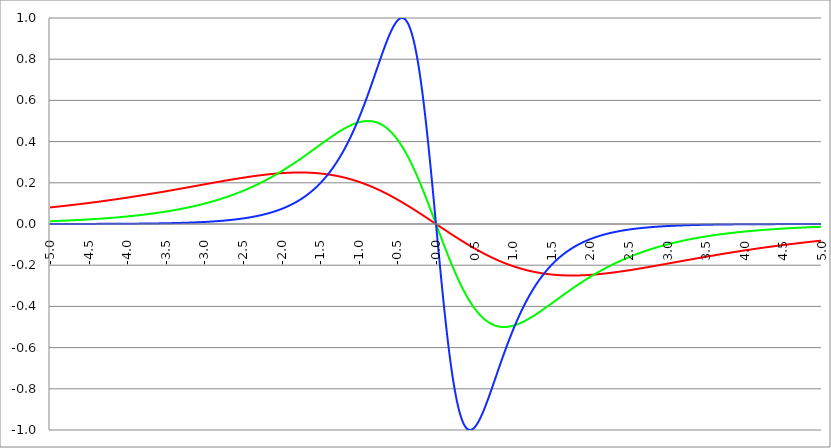
| Category | Series 1 | Series 0 | Series 2 |
|---|---|---|---|
| -5.0 | 0.08 | 0.013 | 0 |
| -4.995 | 0.081 | 0.014 | 0 |
| -4.99 | 0.081 | 0.014 | 0 |
| -4.985 | 0.081 | 0.014 | 0 |
| -4.98 | 0.081 | 0.014 | 0 |
| -4.975 | 0.081 | 0.014 | 0 |
| -4.97 | 0.082 | 0.014 | 0 |
| -4.965000000000001 | 0.082 | 0.014 | 0 |
| -4.960000000000001 | 0.082 | 0.014 | 0 |
| -4.955000000000001 | 0.082 | 0.014 | 0 |
| -4.950000000000001 | 0.082 | 0.014 | 0 |
| -4.945000000000001 | 0.083 | 0.014 | 0 |
| -4.940000000000001 | 0.083 | 0.014 | 0 |
| -4.935000000000001 | 0.083 | 0.014 | 0 |
| -4.930000000000001 | 0.083 | 0.014 | 0 |
| -4.925000000000002 | 0.083 | 0.015 | 0 |
| -4.920000000000002 | 0.084 | 0.015 | 0 |
| -4.915000000000002 | 0.084 | 0.015 | 0 |
| -4.910000000000002 | 0.084 | 0.015 | 0 |
| -4.905000000000002 | 0.084 | 0.015 | 0 |
| -4.900000000000002 | 0.084 | 0.015 | 0 |
| -4.895000000000002 | 0.085 | 0.015 | 0 |
| -4.890000000000002 | 0.085 | 0.015 | 0 |
| -4.885000000000002 | 0.085 | 0.015 | 0 |
| -4.880000000000002 | 0.085 | 0.015 | 0 |
| -4.875000000000003 | 0.085 | 0.015 | 0 |
| -4.870000000000003 | 0.086 | 0.015 | 0 |
| -4.865000000000003 | 0.086 | 0.015 | 0 |
| -4.860000000000003 | 0.086 | 0.015 | 0 |
| -4.855000000000003 | 0.086 | 0.016 | 0 |
| -4.850000000000003 | 0.086 | 0.016 | 0 |
| -4.845000000000003 | 0.087 | 0.016 | 0 |
| -4.840000000000003 | 0.087 | 0.016 | 0 |
| -4.835000000000003 | 0.087 | 0.016 | 0 |
| -4.830000000000004 | 0.087 | 0.016 | 0 |
| -4.825000000000004 | 0.087 | 0.016 | 0 |
| -4.820000000000004 | 0.088 | 0.016 | 0 |
| -4.815000000000004 | 0.088 | 0.016 | 0 |
| -4.810000000000004 | 0.088 | 0.016 | 0 |
| -4.805000000000004 | 0.088 | 0.016 | 0 |
| -4.800000000000004 | 0.089 | 0.016 | 0 |
| -4.795000000000004 | 0.089 | 0.017 | 0 |
| -4.790000000000004 | 0.089 | 0.017 | 0 |
| -4.785000000000004 | 0.089 | 0.017 | 0 |
| -4.780000000000004 | 0.089 | 0.017 | 0 |
| -4.775000000000004 | 0.09 | 0.017 | 0 |
| -4.770000000000004 | 0.09 | 0.017 | 0 |
| -4.765000000000005 | 0.09 | 0.017 | 0 |
| -4.760000000000005 | 0.09 | 0.017 | 0 |
| -4.755000000000005 | 0.09 | 0.017 | 0 |
| -4.750000000000005 | 0.091 | 0.017 | 0 |
| -4.745000000000005 | 0.091 | 0.017 | 0 |
| -4.740000000000005 | 0.091 | 0.017 | 0 |
| -4.735000000000005 | 0.091 | 0.018 | 0 |
| -4.730000000000005 | 0.091 | 0.018 | 0 |
| -4.725000000000006 | 0.092 | 0.018 | 0 |
| -4.720000000000006 | 0.092 | 0.018 | 0 |
| -4.715000000000006 | 0.092 | 0.018 | 0 |
| -4.710000000000006 | 0.092 | 0.018 | 0 |
| -4.705000000000006 | 0.093 | 0.018 | 0 |
| -4.700000000000006 | 0.093 | 0.018 | 0 |
| -4.695000000000006 | 0.093 | 0.018 | 0 |
| -4.690000000000006 | 0.093 | 0.018 | 0 |
| -4.685000000000007 | 0.093 | 0.018 | 0 |
| -4.680000000000007 | 0.094 | 0.019 | 0 |
| -4.675000000000007 | 0.094 | 0.019 | 0 |
| -4.670000000000007 | 0.094 | 0.019 | 0 |
| -4.665000000000007 | 0.094 | 0.019 | 0 |
| -4.660000000000007 | 0.095 | 0.019 | 0 |
| -4.655000000000007 | 0.095 | 0.019 | 0 |
| -4.650000000000007 | 0.095 | 0.019 | 0 |
| -4.645000000000007 | 0.095 | 0.019 | 0 |
| -4.640000000000008 | 0.095 | 0.019 | 0 |
| -4.635000000000008 | 0.096 | 0.019 | 0 |
| -4.630000000000008 | 0.096 | 0.02 | 0 |
| -4.625000000000008 | 0.096 | 0.02 | 0 |
| -4.620000000000008 | 0.096 | 0.02 | 0 |
| -4.615000000000008 | 0.097 | 0.02 | 0 |
| -4.610000000000008 | 0.097 | 0.02 | 0 |
| -4.605000000000008 | 0.097 | 0.02 | 0 |
| -4.600000000000008 | 0.097 | 0.02 | 0 |
| -4.595000000000009 | 0.098 | 0.02 | 0 |
| -4.590000000000009 | 0.098 | 0.02 | 0 |
| -4.585000000000009 | 0.098 | 0.02 | 0 |
| -4.580000000000009 | 0.098 | 0.021 | 0 |
| -4.57500000000001 | 0.098 | 0.021 | 0 |
| -4.57000000000001 | 0.099 | 0.021 | 0 |
| -4.565000000000009 | 0.099 | 0.021 | 0 |
| -4.560000000000009 | 0.099 | 0.021 | 0 |
| -4.555000000000009 | 0.099 | 0.021 | 0 |
| -4.55000000000001 | 0.1 | 0.021 | 0 |
| -4.54500000000001 | 0.1 | 0.021 | 0 |
| -4.54000000000001 | 0.1 | 0.021 | 0 |
| -4.53500000000001 | 0.1 | 0.021 | 0 |
| -4.53000000000001 | 0.101 | 0.022 | 0 |
| -4.52500000000001 | 0.101 | 0.022 | 0 |
| -4.52000000000001 | 0.101 | 0.022 | 0 |
| -4.51500000000001 | 0.101 | 0.022 | 0 |
| -4.51000000000001 | 0.101 | 0.022 | 0 |
| -4.505000000000011 | 0.102 | 0.022 | 0 |
| -4.500000000000011 | 0.102 | 0.022 | 0 |
| -4.495000000000011 | 0.102 | 0.022 | 0 |
| -4.490000000000011 | 0.102 | 0.022 | 0.001 |
| -4.485000000000011 | 0.103 | 0.023 | 0.001 |
| -4.480000000000011 | 0.103 | 0.023 | 0.001 |
| -4.475000000000011 | 0.103 | 0.023 | 0.001 |
| -4.470000000000011 | 0.103 | 0.023 | 0.001 |
| -4.465000000000011 | 0.104 | 0.023 | 0.001 |
| -4.460000000000011 | 0.104 | 0.023 | 0.001 |
| -4.455000000000012 | 0.104 | 0.023 | 0.001 |
| -4.450000000000012 | 0.104 | 0.023 | 0.001 |
| -4.445000000000012 | 0.105 | 0.023 | 0.001 |
| -4.440000000000012 | 0.105 | 0.024 | 0.001 |
| -4.435000000000012 | 0.105 | 0.024 | 0.001 |
| -4.430000000000012 | 0.105 | 0.024 | 0.001 |
| -4.425000000000012 | 0.106 | 0.024 | 0.001 |
| -4.420000000000012 | 0.106 | 0.024 | 0.001 |
| -4.415000000000012 | 0.106 | 0.024 | 0.001 |
| -4.410000000000013 | 0.106 | 0.024 | 0.001 |
| -4.405000000000013 | 0.107 | 0.024 | 0.001 |
| -4.400000000000013 | 0.107 | 0.025 | 0.001 |
| -4.395000000000013 | 0.107 | 0.025 | 0.001 |
| -4.390000000000013 | 0.107 | 0.025 | 0.001 |
| -4.385000000000013 | 0.108 | 0.025 | 0.001 |
| -4.380000000000013 | 0.108 | 0.025 | 0.001 |
| -4.375000000000013 | 0.108 | 0.025 | 0.001 |
| -4.370000000000013 | 0.108 | 0.025 | 0.001 |
| -4.365000000000013 | 0.109 | 0.025 | 0.001 |
| -4.360000000000014 | 0.109 | 0.026 | 0.001 |
| -4.355000000000014 | 0.109 | 0.026 | 0.001 |
| -4.350000000000014 | 0.109 | 0.026 | 0.001 |
| -4.345000000000014 | 0.11 | 0.026 | 0.001 |
| -4.340000000000014 | 0.11 | 0.026 | 0.001 |
| -4.335000000000014 | 0.11 | 0.026 | 0.001 |
| -4.330000000000014 | 0.11 | 0.026 | 0.001 |
| -4.325000000000014 | 0.111 | 0.026 | 0.001 |
| -4.320000000000014 | 0.111 | 0.027 | 0.001 |
| -4.315000000000015 | 0.111 | 0.027 | 0.001 |
| -4.310000000000015 | 0.111 | 0.027 | 0.001 |
| -4.305000000000015 | 0.112 | 0.027 | 0.001 |
| -4.300000000000015 | 0.112 | 0.027 | 0.001 |
| -4.295000000000015 | 0.112 | 0.027 | 0.001 |
| -4.290000000000015 | 0.112 | 0.027 | 0.001 |
| -4.285000000000015 | 0.113 | 0.028 | 0.001 |
| -4.280000000000015 | 0.113 | 0.028 | 0.001 |
| -4.275000000000015 | 0.113 | 0.028 | 0.001 |
| -4.270000000000015 | 0.113 | 0.028 | 0.001 |
| -4.265000000000016 | 0.114 | 0.028 | 0.001 |
| -4.260000000000016 | 0.114 | 0.028 | 0.001 |
| -4.255000000000016 | 0.114 | 0.028 | 0.001 |
| -4.250000000000016 | 0.114 | 0.029 | 0.001 |
| -4.245000000000016 | 0.115 | 0.029 | 0.001 |
| -4.240000000000016 | 0.115 | 0.029 | 0.001 |
| -4.235000000000016 | 0.115 | 0.029 | 0.001 |
| -4.230000000000016 | 0.115 | 0.029 | 0.001 |
| -4.225000000000017 | 0.116 | 0.029 | 0.001 |
| -4.220000000000017 | 0.116 | 0.029 | 0.001 |
| -4.215000000000017 | 0.116 | 0.03 | 0.001 |
| -4.210000000000017 | 0.117 | 0.03 | 0.001 |
| -4.205000000000017 | 0.117 | 0.03 | 0.001 |
| -4.200000000000017 | 0.117 | 0.03 | 0.001 |
| -4.195000000000017 | 0.117 | 0.03 | 0.001 |
| -4.190000000000017 | 0.118 | 0.03 | 0.001 |
| -4.185000000000017 | 0.118 | 0.03 | 0.001 |
| -4.180000000000017 | 0.118 | 0.031 | 0.001 |
| -4.175000000000018 | 0.118 | 0.031 | 0.001 |
| -4.170000000000018 | 0.119 | 0.031 | 0.001 |
| -4.165000000000018 | 0.119 | 0.031 | 0.001 |
| -4.160000000000018 | 0.119 | 0.031 | 0.001 |
| -4.155000000000018 | 0.12 | 0.031 | 0.001 |
| -4.150000000000018 | 0.12 | 0.032 | 0.001 |
| -4.145000000000018 | 0.12 | 0.032 | 0.001 |
| -4.140000000000018 | 0.12 | 0.032 | 0.001 |
| -4.135000000000018 | 0.121 | 0.032 | 0.001 |
| -4.130000000000019 | 0.121 | 0.032 | 0.001 |
| -4.125000000000019 | 0.121 | 0.032 | 0.001 |
| -4.120000000000019 | 0.121 | 0.032 | 0.001 |
| -4.115000000000019 | 0.122 | 0.033 | 0.001 |
| -4.110000000000019 | 0.122 | 0.033 | 0.001 |
| -4.105000000000019 | 0.122 | 0.033 | 0.001 |
| -4.100000000000019 | 0.123 | 0.033 | 0.001 |
| -4.095000000000019 | 0.123 | 0.033 | 0.001 |
| -4.090000000000019 | 0.123 | 0.033 | 0.001 |
| -4.085000000000019 | 0.123 | 0.034 | 0.001 |
| -4.08000000000002 | 0.124 | 0.034 | 0.001 |
| -4.07500000000002 | 0.124 | 0.034 | 0.001 |
| -4.07000000000002 | 0.124 | 0.034 | 0.001 |
| -4.06500000000002 | 0.124 | 0.034 | 0.001 |
| -4.06000000000002 | 0.125 | 0.034 | 0.001 |
| -4.05500000000002 | 0.125 | 0.035 | 0.001 |
| -4.05000000000002 | 0.125 | 0.035 | 0.001 |
| -4.04500000000002 | 0.126 | 0.035 | 0.001 |
| -4.04000000000002 | 0.126 | 0.035 | 0.001 |
| -4.03500000000002 | 0.126 | 0.035 | 0.001 |
| -4.03000000000002 | 0.126 | 0.036 | 0.001 |
| -4.025000000000021 | 0.127 | 0.036 | 0.001 |
| -4.020000000000021 | 0.127 | 0.036 | 0.001 |
| -4.015000000000021 | 0.127 | 0.036 | 0.001 |
| -4.010000000000021 | 0.128 | 0.036 | 0.001 |
| -4.005000000000021 | 0.128 | 0.036 | 0.001 |
| -4.000000000000021 | 0.128 | 0.037 | 0.001 |
| -3.995000000000021 | 0.128 | 0.037 | 0.001 |
| -3.990000000000021 | 0.129 | 0.037 | 0.001 |
| -3.985000000000022 | 0.129 | 0.037 | 0.001 |
| -3.980000000000022 | 0.129 | 0.037 | 0.001 |
| -3.975000000000022 | 0.13 | 0.038 | 0.001 |
| -3.970000000000022 | 0.13 | 0.038 | 0.001 |
| -3.965000000000022 | 0.13 | 0.038 | 0.001 |
| -3.960000000000022 | 0.13 | 0.038 | 0.001 |
| -3.955000000000022 | 0.131 | 0.038 | 0.001 |
| -3.950000000000022 | 0.131 | 0.038 | 0.001 |
| -3.945000000000022 | 0.131 | 0.039 | 0.001 |
| -3.940000000000023 | 0.132 | 0.039 | 0.002 |
| -3.935000000000023 | 0.132 | 0.039 | 0.002 |
| -3.930000000000023 | 0.132 | 0.039 | 0.002 |
| -3.925000000000023 | 0.132 | 0.039 | 0.002 |
| -3.920000000000023 | 0.133 | 0.04 | 0.002 |
| -3.915000000000023 | 0.133 | 0.04 | 0.002 |
| -3.910000000000023 | 0.133 | 0.04 | 0.002 |
| -3.905000000000023 | 0.134 | 0.04 | 0.002 |
| -3.900000000000023 | 0.134 | 0.04 | 0.002 |
| -3.895000000000023 | 0.134 | 0.041 | 0.002 |
| -3.890000000000024 | 0.135 | 0.041 | 0.002 |
| -3.885000000000024 | 0.135 | 0.041 | 0.002 |
| -3.880000000000024 | 0.135 | 0.041 | 0.002 |
| -3.875000000000024 | 0.135 | 0.041 | 0.002 |
| -3.870000000000024 | 0.136 | 0.042 | 0.002 |
| -3.865000000000024 | 0.136 | 0.042 | 0.002 |
| -3.860000000000024 | 0.136 | 0.042 | 0.002 |
| -3.855000000000024 | 0.137 | 0.042 | 0.002 |
| -3.850000000000024 | 0.137 | 0.043 | 0.002 |
| -3.845000000000025 | 0.137 | 0.043 | 0.002 |
| -3.840000000000025 | 0.137 | 0.043 | 0.002 |
| -3.835000000000025 | 0.138 | 0.043 | 0.002 |
| -3.830000000000025 | 0.138 | 0.043 | 0.002 |
| -3.825000000000025 | 0.138 | 0.044 | 0.002 |
| -3.820000000000025 | 0.139 | 0.044 | 0.002 |
| -3.815000000000025 | 0.139 | 0.044 | 0.002 |
| -3.810000000000025 | 0.139 | 0.044 | 0.002 |
| -3.805000000000025 | 0.14 | 0.044 | 0.002 |
| -3.800000000000026 | 0.14 | 0.045 | 0.002 |
| -3.795000000000026 | 0.14 | 0.045 | 0.002 |
| -3.790000000000026 | 0.141 | 0.045 | 0.002 |
| -3.785000000000026 | 0.141 | 0.045 | 0.002 |
| -3.780000000000026 | 0.141 | 0.046 | 0.002 |
| -3.775000000000026 | 0.141 | 0.046 | 0.002 |
| -3.770000000000026 | 0.142 | 0.046 | 0.002 |
| -3.765000000000026 | 0.142 | 0.046 | 0.002 |
| -3.760000000000026 | 0.142 | 0.046 | 0.002 |
| -3.755000000000026 | 0.143 | 0.047 | 0.002 |
| -3.750000000000027 | 0.143 | 0.047 | 0.002 |
| -3.745000000000027 | 0.143 | 0.047 | 0.002 |
| -3.740000000000027 | 0.144 | 0.047 | 0.002 |
| -3.735000000000027 | 0.144 | 0.048 | 0.002 |
| -3.730000000000027 | 0.144 | 0.048 | 0.002 |
| -3.725000000000027 | 0.144 | 0.048 | 0.002 |
| -3.720000000000027 | 0.145 | 0.048 | 0.002 |
| -3.715000000000027 | 0.145 | 0.049 | 0.002 |
| -3.710000000000027 | 0.145 | 0.049 | 0.002 |
| -3.705000000000028 | 0.146 | 0.049 | 0.002 |
| -3.700000000000028 | 0.146 | 0.049 | 0.002 |
| -3.695000000000028 | 0.146 | 0.05 | 0.002 |
| -3.690000000000028 | 0.147 | 0.05 | 0.002 |
| -3.685000000000028 | 0.147 | 0.05 | 0.003 |
| -3.680000000000028 | 0.147 | 0.05 | 0.003 |
| -3.675000000000028 | 0.148 | 0.051 | 0.003 |
| -3.670000000000028 | 0.148 | 0.051 | 0.003 |
| -3.665000000000028 | 0.148 | 0.051 | 0.003 |
| -3.660000000000028 | 0.149 | 0.051 | 0.003 |
| -3.655000000000029 | 0.149 | 0.052 | 0.003 |
| -3.650000000000029 | 0.149 | 0.052 | 0.003 |
| -3.645000000000029 | 0.149 | 0.052 | 0.003 |
| -3.640000000000029 | 0.15 | 0.052 | 0.003 |
| -3.635000000000029 | 0.15 | 0.053 | 0.003 |
| -3.630000000000029 | 0.15 | 0.053 | 0.003 |
| -3.625000000000029 | 0.151 | 0.053 | 0.003 |
| -3.620000000000029 | 0.151 | 0.053 | 0.003 |
| -3.615000000000029 | 0.151 | 0.054 | 0.003 |
| -3.61000000000003 | 0.152 | 0.054 | 0.003 |
| -3.60500000000003 | 0.152 | 0.054 | 0.003 |
| -3.60000000000003 | 0.152 | 0.055 | 0.003 |
| -3.59500000000003 | 0.153 | 0.055 | 0.003 |
| -3.59000000000003 | 0.153 | 0.055 | 0.003 |
| -3.58500000000003 | 0.153 | 0.055 | 0.003 |
| -3.58000000000003 | 0.154 | 0.056 | 0.003 |
| -3.57500000000003 | 0.154 | 0.056 | 0.003 |
| -3.57000000000003 | 0.154 | 0.056 | 0.003 |
| -3.565000000000031 | 0.155 | 0.056 | 0.003 |
| -3.560000000000031 | 0.155 | 0.057 | 0.003 |
| -3.555000000000031 | 0.155 | 0.057 | 0.003 |
| -3.550000000000031 | 0.156 | 0.057 | 0.003 |
| -3.545000000000031 | 0.156 | 0.058 | 0.003 |
| -3.540000000000031 | 0.156 | 0.058 | 0.003 |
| -3.535000000000031 | 0.157 | 0.058 | 0.003 |
| -3.530000000000031 | 0.157 | 0.058 | 0.003 |
| -3.525000000000031 | 0.157 | 0.059 | 0.003 |
| -3.520000000000032 | 0.157 | 0.059 | 0.004 |
| -3.515000000000032 | 0.158 | 0.059 | 0.004 |
| -3.510000000000032 | 0.158 | 0.06 | 0.004 |
| -3.505000000000032 | 0.158 | 0.06 | 0.004 |
| -3.500000000000032 | 0.159 | 0.06 | 0.004 |
| -3.495000000000032 | 0.159 | 0.061 | 0.004 |
| -3.490000000000032 | 0.159 | 0.061 | 0.004 |
| -3.485000000000032 | 0.16 | 0.061 | 0.004 |
| -3.480000000000032 | 0.16 | 0.061 | 0.004 |
| -3.475000000000032 | 0.16 | 0.062 | 0.004 |
| -3.470000000000033 | 0.161 | 0.062 | 0.004 |
| -3.465000000000033 | 0.161 | 0.062 | 0.004 |
| -3.460000000000033 | 0.161 | 0.063 | 0.004 |
| -3.455000000000033 | 0.162 | 0.063 | 0.004 |
| -3.450000000000033 | 0.162 | 0.063 | 0.004 |
| -3.445000000000033 | 0.162 | 0.064 | 0.004 |
| -3.440000000000033 | 0.163 | 0.064 | 0.004 |
| -3.435000000000033 | 0.163 | 0.064 | 0.004 |
| -3.430000000000033 | 0.163 | 0.065 | 0.004 |
| -3.425000000000034 | 0.164 | 0.065 | 0.004 |
| -3.420000000000034 | 0.164 | 0.065 | 0.004 |
| -3.415000000000034 | 0.164 | 0.066 | 0.004 |
| -3.410000000000034 | 0.165 | 0.066 | 0.004 |
| -3.405000000000034 | 0.165 | 0.066 | 0.004 |
| -3.400000000000034 | 0.165 | 0.067 | 0.004 |
| -3.395000000000034 | 0.166 | 0.067 | 0.004 |
| -3.390000000000034 | 0.166 | 0.067 | 0.005 |
| -3.385000000000034 | 0.166 | 0.068 | 0.005 |
| -3.380000000000034 | 0.167 | 0.068 | 0.005 |
| -3.375000000000035 | 0.167 | 0.068 | 0.005 |
| -3.370000000000035 | 0.167 | 0.069 | 0.005 |
| -3.365000000000035 | 0.168 | 0.069 | 0.005 |
| -3.360000000000035 | 0.168 | 0.069 | 0.005 |
| -3.355000000000035 | 0.168 | 0.07 | 0.005 |
| -3.350000000000035 | 0.169 | 0.07 | 0.005 |
| -3.345000000000035 | 0.169 | 0.07 | 0.005 |
| -3.340000000000035 | 0.169 | 0.071 | 0.005 |
| -3.335000000000035 | 0.17 | 0.071 | 0.005 |
| -3.330000000000036 | 0.17 | 0.071 | 0.005 |
| -3.325000000000036 | 0.17 | 0.072 | 0.005 |
| -3.320000000000036 | 0.171 | 0.072 | 0.005 |
| -3.315000000000036 | 0.171 | 0.072 | 0.005 |
| -3.310000000000036 | 0.171 | 0.073 | 0.005 |
| -3.305000000000036 | 0.172 | 0.073 | 0.005 |
| -3.300000000000036 | 0.172 | 0.073 | 0.005 |
| -3.295000000000036 | 0.172 | 0.074 | 0.005 |
| -3.290000000000036 | 0.173 | 0.074 | 0.006 |
| -3.285000000000036 | 0.173 | 0.075 | 0.006 |
| -3.280000000000036 | 0.173 | 0.075 | 0.006 |
| -3.275000000000037 | 0.174 | 0.075 | 0.006 |
| -3.270000000000037 | 0.174 | 0.076 | 0.006 |
| -3.265000000000037 | 0.174 | 0.076 | 0.006 |
| -3.260000000000037 | 0.175 | 0.076 | 0.006 |
| -3.255000000000037 | 0.175 | 0.077 | 0.006 |
| -3.250000000000037 | 0.175 | 0.077 | 0.006 |
| -3.245000000000037 | 0.176 | 0.078 | 0.006 |
| -3.240000000000037 | 0.176 | 0.078 | 0.006 |
| -3.235000000000038 | 0.176 | 0.078 | 0.006 |
| -3.230000000000038 | 0.177 | 0.079 | 0.006 |
| -3.225000000000038 | 0.177 | 0.079 | 0.006 |
| -3.220000000000038 | 0.177 | 0.08 | 0.006 |
| -3.215000000000038 | 0.178 | 0.08 | 0.006 |
| -3.210000000000038 | 0.178 | 0.08 | 0.007 |
| -3.205000000000038 | 0.178 | 0.081 | 0.007 |
| -3.200000000000038 | 0.179 | 0.081 | 0.007 |
| -3.195000000000038 | 0.179 | 0.082 | 0.007 |
| -3.190000000000039 | 0.179 | 0.082 | 0.007 |
| -3.185000000000039 | 0.18 | 0.082 | 0.007 |
| -3.180000000000039 | 0.18 | 0.083 | 0.007 |
| -3.175000000000039 | 0.18 | 0.083 | 0.007 |
| -3.170000000000039 | 0.181 | 0.084 | 0.007 |
| -3.16500000000004 | 0.181 | 0.084 | 0.007 |
| -3.16000000000004 | 0.182 | 0.084 | 0.007 |
| -3.155000000000039 | 0.182 | 0.085 | 0.007 |
| -3.150000000000039 | 0.182 | 0.085 | 0.007 |
| -3.14500000000004 | 0.183 | 0.086 | 0.007 |
| -3.14000000000004 | 0.183 | 0.086 | 0.007 |
| -3.13500000000004 | 0.183 | 0.087 | 0.008 |
| -3.13000000000004 | 0.184 | 0.087 | 0.008 |
| -3.12500000000004 | 0.184 | 0.087 | 0.008 |
| -3.12000000000004 | 0.184 | 0.088 | 0.008 |
| -3.11500000000004 | 0.185 | 0.088 | 0.008 |
| -3.11000000000004 | 0.185 | 0.089 | 0.008 |
| -3.10500000000004 | 0.185 | 0.089 | 0.008 |
| -3.10000000000004 | 0.186 | 0.09 | 0.008 |
| -3.095000000000041 | 0.186 | 0.09 | 0.008 |
| -3.090000000000041 | 0.186 | 0.09 | 0.008 |
| -3.085000000000041 | 0.187 | 0.091 | 0.008 |
| -3.080000000000041 | 0.187 | 0.091 | 0.008 |
| -3.075000000000041 | 0.187 | 0.092 | 0.009 |
| -3.070000000000041 | 0.188 | 0.092 | 0.009 |
| -3.065000000000041 | 0.188 | 0.093 | 0.009 |
| -3.060000000000041 | 0.188 | 0.093 | 0.009 |
| -3.055000000000041 | 0.189 | 0.094 | 0.009 |
| -3.050000000000042 | 0.189 | 0.094 | 0.009 |
| -3.045000000000042 | 0.189 | 0.095 | 0.009 |
| -3.040000000000042 | 0.19 | 0.095 | 0.009 |
| -3.035000000000042 | 0.19 | 0.095 | 0.009 |
| -3.030000000000042 | 0.19 | 0.096 | 0.009 |
| -3.025000000000042 | 0.191 | 0.096 | 0.009 |
| -3.020000000000042 | 0.191 | 0.097 | 0.01 |
| -3.015000000000042 | 0.191 | 0.097 | 0.01 |
| -3.010000000000042 | 0.192 | 0.098 | 0.01 |
| -3.005000000000043 | 0.192 | 0.098 | 0.01 |
| -3.000000000000043 | 0.192 | 0.099 | 0.01 |
| -2.995000000000043 | 0.193 | 0.099 | 0.01 |
| -2.990000000000043 | 0.193 | 0.1 | 0.01 |
| -2.985000000000043 | 0.193 | 0.1 | 0.01 |
| -2.980000000000043 | 0.194 | 0.101 | 0.01 |
| -2.975000000000043 | 0.194 | 0.101 | 0.01 |
| -2.970000000000043 | 0.194 | 0.102 | 0.011 |
| -2.965000000000043 | 0.195 | 0.102 | 0.011 |
| -2.960000000000043 | 0.195 | 0.103 | 0.011 |
| -2.955000000000044 | 0.195 | 0.103 | 0.011 |
| -2.950000000000044 | 0.196 | 0.104 | 0.011 |
| -2.945000000000044 | 0.196 | 0.104 | 0.011 |
| -2.940000000000044 | 0.196 | 0.105 | 0.011 |
| -2.935000000000044 | 0.197 | 0.105 | 0.011 |
| -2.930000000000044 | 0.197 | 0.106 | 0.011 |
| -2.925000000000044 | 0.197 | 0.106 | 0.012 |
| -2.920000000000044 | 0.198 | 0.107 | 0.012 |
| -2.915000000000044 | 0.198 | 0.107 | 0.012 |
| -2.910000000000045 | 0.198 | 0.108 | 0.012 |
| -2.905000000000045 | 0.199 | 0.109 | 0.012 |
| -2.900000000000045 | 0.199 | 0.109 | 0.012 |
| -2.895000000000045 | 0.199 | 0.11 | 0.012 |
| -2.890000000000045 | 0.2 | 0.11 | 0.012 |
| -2.885000000000045 | 0.2 | 0.111 | 0.012 |
| -2.880000000000045 | 0.2 | 0.111 | 0.013 |
| -2.875000000000045 | 0.201 | 0.112 | 0.013 |
| -2.870000000000045 | 0.201 | 0.112 | 0.013 |
| -2.865000000000045 | 0.201 | 0.113 | 0.013 |
| -2.860000000000046 | 0.202 | 0.113 | 0.013 |
| -2.855000000000046 | 0.202 | 0.114 | 0.013 |
| -2.850000000000046 | 0.202 | 0.115 | 0.013 |
| -2.845000000000046 | 0.203 | 0.115 | 0.014 |
| -2.840000000000046 | 0.203 | 0.116 | 0.014 |
| -2.835000000000046 | 0.203 | 0.116 | 0.014 |
| -2.830000000000046 | 0.204 | 0.117 | 0.014 |
| -2.825000000000046 | 0.204 | 0.117 | 0.014 |
| -2.820000000000046 | 0.204 | 0.118 | 0.014 |
| -2.815000000000047 | 0.205 | 0.119 | 0.014 |
| -2.810000000000047 | 0.205 | 0.119 | 0.014 |
| -2.805000000000047 | 0.205 | 0.12 | 0.015 |
| -2.800000000000047 | 0.206 | 0.12 | 0.015 |
| -2.795000000000047 | 0.206 | 0.121 | 0.015 |
| -2.790000000000047 | 0.206 | 0.121 | 0.015 |
| -2.785000000000047 | 0.207 | 0.122 | 0.015 |
| -2.780000000000047 | 0.207 | 0.123 | 0.015 |
| -2.775000000000047 | 0.207 | 0.123 | 0.016 |
| -2.770000000000047 | 0.208 | 0.124 | 0.016 |
| -2.765000000000048 | 0.208 | 0.124 | 0.016 |
| -2.760000000000048 | 0.208 | 0.125 | 0.016 |
| -2.755000000000048 | 0.209 | 0.126 | 0.016 |
| -2.750000000000048 | 0.209 | 0.126 | 0.016 |
| -2.745000000000048 | 0.209 | 0.127 | 0.017 |
| -2.740000000000048 | 0.21 | 0.128 | 0.017 |
| -2.735000000000048 | 0.21 | 0.128 | 0.017 |
| -2.730000000000048 | 0.21 | 0.129 | 0.017 |
| -2.725000000000048 | 0.211 | 0.129 | 0.017 |
| -2.720000000000049 | 0.211 | 0.13 | 0.017 |
| -2.715000000000049 | 0.211 | 0.131 | 0.018 |
| -2.710000000000049 | 0.212 | 0.131 | 0.018 |
| -2.705000000000049 | 0.212 | 0.132 | 0.018 |
| -2.700000000000049 | 0.212 | 0.133 | 0.018 |
| -2.695000000000049 | 0.213 | 0.133 | 0.018 |
| -2.690000000000049 | 0.213 | 0.134 | 0.018 |
| -2.685000000000049 | 0.213 | 0.135 | 0.019 |
| -2.680000000000049 | 0.214 | 0.135 | 0.019 |
| -2.675000000000049 | 0.214 | 0.136 | 0.019 |
| -2.67000000000005 | 0.214 | 0.137 | 0.019 |
| -2.66500000000005 | 0.215 | 0.137 | 0.019 |
| -2.66000000000005 | 0.215 | 0.138 | 0.02 |
| -2.65500000000005 | 0.215 | 0.139 | 0.02 |
| -2.65000000000005 | 0.215 | 0.139 | 0.02 |
| -2.64500000000005 | 0.216 | 0.14 | 0.02 |
| -2.64000000000005 | 0.216 | 0.141 | 0.02 |
| -2.63500000000005 | 0.216 | 0.141 | 0.021 |
| -2.63000000000005 | 0.217 | 0.142 | 0.021 |
| -2.625000000000051 | 0.217 | 0.143 | 0.021 |
| -2.620000000000051 | 0.217 | 0.143 | 0.021 |
| -2.615000000000051 | 0.218 | 0.144 | 0.021 |
| -2.610000000000051 | 0.218 | 0.145 | 0.022 |
| -2.605000000000051 | 0.218 | 0.145 | 0.022 |
| -2.600000000000051 | 0.219 | 0.146 | 0.022 |
| -2.595000000000051 | 0.219 | 0.147 | 0.022 |
| -2.590000000000051 | 0.219 | 0.148 | 0.023 |
| -2.585000000000051 | 0.22 | 0.148 | 0.023 |
| -2.580000000000052 | 0.22 | 0.149 | 0.023 |
| -2.575000000000052 | 0.22 | 0.15 | 0.023 |
| -2.570000000000052 | 0.22 | 0.15 | 0.023 |
| -2.565000000000052 | 0.221 | 0.151 | 0.024 |
| -2.560000000000052 | 0.221 | 0.152 | 0.024 |
| -2.555000000000052 | 0.221 | 0.153 | 0.024 |
| -2.550000000000052 | 0.222 | 0.153 | 0.024 |
| -2.545000000000052 | 0.222 | 0.154 | 0.025 |
| -2.540000000000052 | 0.222 | 0.155 | 0.025 |
| -2.535000000000053 | 0.223 | 0.156 | 0.025 |
| -2.530000000000053 | 0.223 | 0.156 | 0.025 |
| -2.525000000000053 | 0.223 | 0.157 | 0.026 |
| -2.520000000000053 | 0.223 | 0.158 | 0.026 |
| -2.515000000000053 | 0.224 | 0.159 | 0.026 |
| -2.510000000000053 | 0.224 | 0.159 | 0.026 |
| -2.505000000000053 | 0.224 | 0.16 | 0.027 |
| -2.500000000000053 | 0.225 | 0.161 | 0.027 |
| -2.495000000000053 | 0.225 | 0.162 | 0.027 |
| -2.490000000000053 | 0.225 | 0.162 | 0.027 |
| -2.485000000000054 | 0.225 | 0.163 | 0.028 |
| -2.480000000000054 | 0.226 | 0.164 | 0.028 |
| -2.475000000000054 | 0.226 | 0.165 | 0.028 |
| -2.470000000000054 | 0.226 | 0.166 | 0.029 |
| -2.465000000000054 | 0.227 | 0.166 | 0.029 |
| -2.460000000000054 | 0.227 | 0.167 | 0.029 |
| -2.455000000000054 | 0.227 | 0.168 | 0.029 |
| -2.450000000000054 | 0.227 | 0.169 | 0.03 |
| -2.445000000000054 | 0.228 | 0.17 | 0.03 |
| -2.440000000000055 | 0.228 | 0.17 | 0.03 |
| -2.435000000000055 | 0.228 | 0.171 | 0.031 |
| -2.430000000000055 | 0.229 | 0.172 | 0.031 |
| -2.425000000000055 | 0.229 | 0.173 | 0.031 |
| -2.420000000000055 | 0.229 | 0.174 | 0.032 |
| -2.415000000000055 | 0.229 | 0.175 | 0.032 |
| -2.410000000000055 | 0.23 | 0.175 | 0.032 |
| -2.405000000000055 | 0.23 | 0.176 | 0.033 |
| -2.400000000000055 | 0.23 | 0.177 | 0.033 |
| -2.395000000000055 | 0.23 | 0.178 | 0.033 |
| -2.390000000000056 | 0.231 | 0.179 | 0.034 |
| -2.385000000000056 | 0.231 | 0.18 | 0.034 |
| -2.380000000000056 | 0.231 | 0.18 | 0.034 |
| -2.375000000000056 | 0.232 | 0.181 | 0.035 |
| -2.370000000000056 | 0.232 | 0.182 | 0.035 |
| -2.365000000000056 | 0.232 | 0.183 | 0.035 |
| -2.360000000000056 | 0.232 | 0.184 | 0.036 |
| -2.355000000000056 | 0.233 | 0.185 | 0.036 |
| -2.350000000000056 | 0.233 | 0.186 | 0.036 |
| -2.345000000000057 | 0.233 | 0.186 | 0.037 |
| -2.340000000000057 | 0.233 | 0.187 | 0.037 |
| -2.335000000000057 | 0.234 | 0.188 | 0.037 |
| -2.330000000000057 | 0.234 | 0.189 | 0.038 |
| -2.325000000000057 | 0.234 | 0.19 | 0.038 |
| -2.320000000000057 | 0.234 | 0.191 | 0.039 |
| -2.315000000000057 | 0.235 | 0.192 | 0.039 |
| -2.310000000000057 | 0.235 | 0.193 | 0.039 |
| -2.305000000000057 | 0.235 | 0.194 | 0.04 |
| -2.300000000000058 | 0.235 | 0.195 | 0.04 |
| -2.295000000000058 | 0.236 | 0.195 | 0.041 |
| -2.290000000000058 | 0.236 | 0.196 | 0.041 |
| -2.285000000000058 | 0.236 | 0.197 | 0.041 |
| -2.280000000000058 | 0.236 | 0.198 | 0.042 |
| -2.275000000000058 | 0.237 | 0.199 | 0.042 |
| -2.270000000000058 | 0.237 | 0.2 | 0.043 |
| -2.265000000000058 | 0.237 | 0.201 | 0.043 |
| -2.260000000000058 | 0.237 | 0.202 | 0.044 |
| -2.255000000000058 | 0.237 | 0.203 | 0.044 |
| -2.250000000000059 | 0.238 | 0.204 | 0.044 |
| -2.245000000000059 | 0.238 | 0.205 | 0.045 |
| -2.240000000000059 | 0.238 | 0.206 | 0.045 |
| -2.235000000000059 | 0.238 | 0.207 | 0.046 |
| -2.23000000000006 | 0.239 | 0.208 | 0.046 |
| -2.22500000000006 | 0.239 | 0.209 | 0.047 |
| -2.22000000000006 | 0.239 | 0.21 | 0.047 |
| -2.215000000000059 | 0.239 | 0.211 | 0.048 |
| -2.210000000000059 | 0.239 | 0.212 | 0.048 |
| -2.20500000000006 | 0.24 | 0.213 | 0.049 |
| -2.20000000000006 | 0.24 | 0.214 | 0.049 |
| -2.19500000000006 | 0.24 | 0.215 | 0.05 |
| -2.19000000000006 | 0.24 | 0.216 | 0.05 |
| -2.18500000000006 | 0.241 | 0.217 | 0.051 |
| -2.18000000000006 | 0.241 | 0.218 | 0.051 |
| -2.17500000000006 | 0.241 | 0.219 | 0.052 |
| -2.17000000000006 | 0.241 | 0.22 | 0.052 |
| -2.16500000000006 | 0.241 | 0.221 | 0.053 |
| -2.160000000000061 | 0.242 | 0.222 | 0.053 |
| -2.155000000000061 | 0.242 | 0.223 | 0.054 |
| -2.150000000000061 | 0.242 | 0.224 | 0.054 |
| -2.145000000000061 | 0.242 | 0.225 | 0.055 |
| -2.140000000000061 | 0.242 | 0.226 | 0.055 |
| -2.135000000000061 | 0.242 | 0.227 | 0.056 |
| -2.130000000000061 | 0.243 | 0.228 | 0.056 |
| -2.125000000000061 | 0.243 | 0.229 | 0.057 |
| -2.120000000000061 | 0.243 | 0.23 | 0.058 |
| -2.115000000000061 | 0.243 | 0.231 | 0.058 |
| -2.110000000000062 | 0.243 | 0.232 | 0.059 |
| -2.105000000000062 | 0.244 | 0.233 | 0.059 |
| -2.100000000000062 | 0.244 | 0.234 | 0.06 |
| -2.095000000000062 | 0.244 | 0.235 | 0.061 |
| -2.090000000000062 | 0.244 | 0.236 | 0.061 |
| -2.085000000000062 | 0.244 | 0.237 | 0.062 |
| -2.080000000000062 | 0.244 | 0.238 | 0.062 |
| -2.075000000000062 | 0.245 | 0.24 | 0.063 |
| -2.070000000000062 | 0.245 | 0.241 | 0.064 |
| -2.065000000000063 | 0.245 | 0.242 | 0.064 |
| -2.060000000000063 | 0.245 | 0.243 | 0.065 |
| -2.055000000000063 | 0.245 | 0.244 | 0.066 |
| -2.050000000000063 | 0.245 | 0.245 | 0.066 |
| -2.045000000000063 | 0.246 | 0.246 | 0.067 |
| -2.040000000000063 | 0.246 | 0.247 | 0.068 |
| -2.035000000000063 | 0.246 | 0.248 | 0.068 |
| -2.030000000000063 | 0.246 | 0.249 | 0.069 |
| -2.025000000000063 | 0.246 | 0.251 | 0.07 |
| -2.020000000000064 | 0.246 | 0.252 | 0.07 |
| -2.015000000000064 | 0.246 | 0.253 | 0.071 |
| -2.010000000000064 | 0.247 | 0.254 | 0.072 |
| -2.005000000000064 | 0.247 | 0.255 | 0.072 |
| -2.000000000000064 | 0.247 | 0.256 | 0.073 |
| -1.995000000000064 | 0.247 | 0.257 | 0.074 |
| -1.990000000000064 | 0.247 | 0.259 | 0.075 |
| -1.985000000000064 | 0.247 | 0.26 | 0.075 |
| -1.980000000000064 | 0.247 | 0.261 | 0.076 |
| -1.975000000000064 | 0.247 | 0.262 | 0.077 |
| -1.970000000000065 | 0.248 | 0.263 | 0.078 |
| -1.965000000000065 | 0.248 | 0.264 | 0.078 |
| -1.960000000000065 | 0.248 | 0.265 | 0.079 |
| -1.955000000000065 | 0.248 | 0.267 | 0.08 |
| -1.950000000000065 | 0.248 | 0.268 | 0.081 |
| -1.945000000000065 | 0.248 | 0.269 | 0.082 |
| -1.940000000000065 | 0.248 | 0.27 | 0.082 |
| -1.935000000000065 | 0.248 | 0.271 | 0.083 |
| -1.930000000000065 | 0.248 | 0.273 | 0.084 |
| -1.925000000000066 | 0.248 | 0.274 | 0.085 |
| -1.920000000000066 | 0.249 | 0.275 | 0.086 |
| -1.915000000000066 | 0.249 | 0.276 | 0.087 |
| -1.910000000000066 | 0.249 | 0.277 | 0.088 |
| -1.905000000000066 | 0.249 | 0.279 | 0.088 |
| -1.900000000000066 | 0.249 | 0.28 | 0.089 |
| -1.895000000000066 | 0.249 | 0.281 | 0.09 |
| -1.890000000000066 | 0.249 | 0.282 | 0.091 |
| -1.885000000000066 | 0.249 | 0.283 | 0.092 |
| -1.880000000000066 | 0.249 | 0.285 | 0.093 |
| -1.875000000000067 | 0.249 | 0.286 | 0.094 |
| -1.870000000000067 | 0.249 | 0.287 | 0.095 |
| -1.865000000000067 | 0.249 | 0.288 | 0.096 |
| -1.860000000000067 | 0.249 | 0.29 | 0.097 |
| -1.855000000000067 | 0.249 | 0.291 | 0.098 |
| -1.850000000000067 | 0.25 | 0.292 | 0.099 |
| -1.845000000000067 | 0.25 | 0.293 | 0.1 |
| -1.840000000000067 | 0.25 | 0.295 | 0.101 |
| -1.835000000000067 | 0.25 | 0.296 | 0.102 |
| -1.830000000000068 | 0.25 | 0.297 | 0.103 |
| -1.825000000000068 | 0.25 | 0.298 | 0.104 |
| -1.820000000000068 | 0.25 | 0.3 | 0.105 |
| -1.815000000000068 | 0.25 | 0.301 | 0.106 |
| -1.810000000000068 | 0.25 | 0.302 | 0.107 |
| -1.805000000000068 | 0.25 | 0.303 | 0.108 |
| -1.800000000000068 | 0.25 | 0.305 | 0.109 |
| -1.795000000000068 | 0.25 | 0.306 | 0.11 |
| -1.790000000000068 | 0.25 | 0.307 | 0.111 |
| -1.785000000000068 | 0.25 | 0.309 | 0.112 |
| -1.780000000000069 | 0.25 | 0.31 | 0.113 |
| -1.775000000000069 | 0.25 | 0.311 | 0.115 |
| -1.770000000000069 | 0.25 | 0.312 | 0.116 |
| -1.765000000000069 | 0.25 | 0.314 | 0.117 |
| -1.760000000000069 | 0.25 | 0.315 | 0.118 |
| -1.75500000000007 | 0.25 | 0.316 | 0.119 |
| -1.75000000000007 | 0.25 | 0.318 | 0.12 |
| -1.745000000000069 | 0.25 | 0.319 | 0.122 |
| -1.740000000000069 | 0.25 | 0.32 | 0.123 |
| -1.73500000000007 | 0.25 | 0.322 | 0.124 |
| -1.73000000000007 | 0.25 | 0.323 | 0.125 |
| -1.72500000000007 | 0.25 | 0.324 | 0.127 |
| -1.72000000000007 | 0.25 | 0.325 | 0.128 |
| -1.71500000000007 | 0.25 | 0.327 | 0.129 |
| -1.71000000000007 | 0.25 | 0.328 | 0.13 |
| -1.70500000000007 | 0.25 | 0.329 | 0.132 |
| -1.70000000000007 | 0.25 | 0.331 | 0.133 |
| -1.69500000000007 | 0.25 | 0.332 | 0.134 |
| -1.69000000000007 | 0.25 | 0.333 | 0.136 |
| -1.685000000000071 | 0.25 | 0.335 | 0.137 |
| -1.680000000000071 | 0.25 | 0.336 | 0.138 |
| -1.675000000000071 | 0.25 | 0.337 | 0.14 |
| -1.670000000000071 | 0.249 | 0.339 | 0.141 |
| -1.665000000000071 | 0.249 | 0.34 | 0.143 |
| -1.660000000000071 | 0.249 | 0.341 | 0.144 |
| -1.655000000000071 | 0.249 | 0.343 | 0.145 |
| -1.650000000000071 | 0.249 | 0.344 | 0.147 |
| -1.645000000000071 | 0.249 | 0.345 | 0.148 |
| -1.640000000000072 | 0.249 | 0.347 | 0.15 |
| -1.635000000000072 | 0.249 | 0.348 | 0.151 |
| -1.630000000000072 | 0.249 | 0.349 | 0.153 |
| -1.625000000000072 | 0.249 | 0.351 | 0.154 |
| -1.620000000000072 | 0.249 | 0.352 | 0.156 |
| -1.615000000000072 | 0.249 | 0.354 | 0.157 |
| -1.610000000000072 | 0.248 | 0.355 | 0.159 |
| -1.605000000000072 | 0.248 | 0.356 | 0.161 |
| -1.600000000000072 | 0.248 | 0.358 | 0.162 |
| -1.595000000000073 | 0.248 | 0.359 | 0.164 |
| -1.590000000000073 | 0.248 | 0.36 | 0.165 |
| -1.585000000000073 | 0.248 | 0.362 | 0.167 |
| -1.580000000000073 | 0.248 | 0.363 | 0.169 |
| -1.575000000000073 | 0.248 | 0.364 | 0.17 |
| -1.570000000000073 | 0.248 | 0.366 | 0.172 |
| -1.565000000000073 | 0.247 | 0.367 | 0.174 |
| -1.560000000000073 | 0.247 | 0.368 | 0.176 |
| -1.555000000000073 | 0.247 | 0.37 | 0.177 |
| -1.550000000000074 | 0.247 | 0.371 | 0.179 |
| -1.545000000000074 | 0.247 | 0.373 | 0.181 |
| -1.540000000000074 | 0.247 | 0.374 | 0.183 |
| -1.535000000000074 | 0.247 | 0.375 | 0.184 |
| -1.530000000000074 | 0.246 | 0.377 | 0.186 |
| -1.525000000000074 | 0.246 | 0.378 | 0.188 |
| -1.520000000000074 | 0.246 | 0.379 | 0.19 |
| -1.515000000000074 | 0.246 | 0.381 | 0.192 |
| -1.510000000000074 | 0.246 | 0.382 | 0.194 |
| -1.505000000000074 | 0.245 | 0.383 | 0.196 |
| -1.500000000000075 | 0.245 | 0.385 | 0.198 |
| -1.495000000000075 | 0.245 | 0.386 | 0.2 |
| -1.490000000000075 | 0.245 | 0.387 | 0.202 |
| -1.485000000000075 | 0.245 | 0.389 | 0.204 |
| -1.480000000000075 | 0.245 | 0.39 | 0.206 |
| -1.475000000000075 | 0.244 | 0.392 | 0.208 |
| -1.470000000000075 | 0.244 | 0.393 | 0.21 |
| -1.465000000000075 | 0.244 | 0.394 | 0.212 |
| -1.460000000000075 | 0.244 | 0.396 | 0.214 |
| -1.455000000000076 | 0.243 | 0.397 | 0.216 |
| -1.450000000000076 | 0.243 | 0.398 | 0.218 |
| -1.445000000000076 | 0.243 | 0.4 | 0.22 |
| -1.440000000000076 | 0.243 | 0.401 | 0.222 |
| -1.435000000000076 | 0.243 | 0.402 | 0.225 |
| -1.430000000000076 | 0.242 | 0.404 | 0.227 |
| -1.425000000000076 | 0.242 | 0.405 | 0.229 |
| -1.420000000000076 | 0.242 | 0.406 | 0.231 |
| -1.415000000000076 | 0.242 | 0.408 | 0.234 |
| -1.410000000000077 | 0.241 | 0.409 | 0.236 |
| -1.405000000000077 | 0.241 | 0.41 | 0.238 |
| -1.400000000000077 | 0.241 | 0.412 | 0.241 |
| -1.395000000000077 | 0.24 | 0.413 | 0.243 |
| -1.390000000000077 | 0.24 | 0.414 | 0.245 |
| -1.385000000000077 | 0.24 | 0.416 | 0.248 |
| -1.380000000000077 | 0.24 | 0.417 | 0.25 |
| -1.375000000000077 | 0.239 | 0.418 | 0.253 |
| -1.370000000000077 | 0.239 | 0.419 | 0.255 |
| -1.365000000000077 | 0.239 | 0.421 | 0.258 |
| -1.360000000000078 | 0.238 | 0.422 | 0.26 |
| -1.355000000000078 | 0.238 | 0.423 | 0.263 |
| -1.350000000000078 | 0.238 | 0.425 | 0.265 |
| -1.345000000000078 | 0.238 | 0.426 | 0.268 |
| -1.340000000000078 | 0.237 | 0.427 | 0.27 |
| -1.335000000000078 | 0.237 | 0.428 | 0.273 |
| -1.330000000000078 | 0.237 | 0.43 | 0.276 |
| -1.325000000000078 | 0.236 | 0.431 | 0.278 |
| -1.320000000000078 | 0.236 | 0.432 | 0.281 |
| -1.315000000000079 | 0.236 | 0.434 | 0.284 |
| -1.310000000000079 | 0.235 | 0.435 | 0.287 |
| -1.305000000000079 | 0.235 | 0.436 | 0.289 |
| -1.300000000000079 | 0.235 | 0.437 | 0.292 |
| -1.295000000000079 | 0.234 | 0.438 | 0.295 |
| -1.29000000000008 | 0.234 | 0.44 | 0.298 |
| -1.285000000000079 | 0.233 | 0.441 | 0.301 |
| -1.280000000000079 | 0.233 | 0.442 | 0.304 |
| -1.275000000000079 | 0.233 | 0.443 | 0.307 |
| -1.270000000000079 | 0.232 | 0.444 | 0.31 |
| -1.26500000000008 | 0.232 | 0.446 | 0.313 |
| -1.26000000000008 | 0.232 | 0.447 | 0.316 |
| -1.25500000000008 | 0.231 | 0.448 | 0.319 |
| -1.25000000000008 | 0.231 | 0.449 | 0.322 |
| -1.24500000000008 | 0.23 | 0.45 | 0.325 |
| -1.24000000000008 | 0.23 | 0.452 | 0.328 |
| -1.23500000000008 | 0.23 | 0.453 | 0.331 |
| -1.23000000000008 | 0.229 | 0.454 | 0.334 |
| -1.22500000000008 | 0.229 | 0.455 | 0.338 |
| -1.220000000000081 | 0.228 | 0.456 | 0.341 |
| -1.215000000000081 | 0.228 | 0.457 | 0.344 |
| -1.210000000000081 | 0.227 | 0.458 | 0.347 |
| -1.205000000000081 | 0.227 | 0.459 | 0.351 |
| -1.200000000000081 | 0.227 | 0.46 | 0.354 |
| -1.195000000000081 | 0.226 | 0.461 | 0.357 |
| -1.190000000000081 | 0.226 | 0.463 | 0.361 |
| -1.185000000000081 | 0.225 | 0.464 | 0.364 |
| -1.180000000000081 | 0.225 | 0.465 | 0.368 |
| -1.175000000000082 | 0.224 | 0.466 | 0.371 |
| -1.170000000000082 | 0.224 | 0.467 | 0.375 |
| -1.165000000000082 | 0.223 | 0.468 | 0.378 |
| -1.160000000000082 | 0.223 | 0.469 | 0.382 |
| -1.155000000000082 | 0.222 | 0.47 | 0.385 |
| -1.150000000000082 | 0.222 | 0.471 | 0.389 |
| -1.145000000000082 | 0.221 | 0.472 | 0.393 |
| -1.140000000000082 | 0.221 | 0.473 | 0.397 |
| -1.135000000000082 | 0.22 | 0.474 | 0.4 |
| -1.130000000000082 | 0.22 | 0.474 | 0.404 |
| -1.125000000000083 | 0.219 | 0.475 | 0.408 |
| -1.120000000000083 | 0.219 | 0.476 | 0.412 |
| -1.115000000000083 | 0.218 | 0.477 | 0.415 |
| -1.110000000000083 | 0.218 | 0.478 | 0.419 |
| -1.105000000000083 | 0.217 | 0.479 | 0.423 |
| -1.100000000000083 | 0.217 | 0.48 | 0.427 |
| -1.095000000000083 | 0.216 | 0.481 | 0.431 |
| -1.090000000000083 | 0.216 | 0.481 | 0.435 |
| -1.085000000000083 | 0.215 | 0.482 | 0.439 |
| -1.080000000000084 | 0.214 | 0.483 | 0.443 |
| -1.075000000000084 | 0.214 | 0.484 | 0.447 |
| -1.070000000000084 | 0.213 | 0.485 | 0.452 |
| -1.065000000000084 | 0.213 | 0.485 | 0.456 |
| -1.060000000000084 | 0.212 | 0.486 | 0.46 |
| -1.055000000000084 | 0.212 | 0.487 | 0.464 |
| -1.050000000000084 | 0.211 | 0.487 | 0.468 |
| -1.045000000000084 | 0.21 | 0.488 | 0.473 |
| -1.040000000000084 | 0.21 | 0.489 | 0.477 |
| -1.035000000000085 | 0.209 | 0.489 | 0.481 |
| -1.030000000000085 | 0.209 | 0.49 | 0.486 |
| -1.025000000000085 | 0.208 | 0.491 | 0.49 |
| -1.020000000000085 | 0.207 | 0.491 | 0.494 |
| -1.015000000000085 | 0.207 | 0.492 | 0.499 |
| -1.010000000000085 | 0.206 | 0.492 | 0.503 |
| -1.005000000000085 | 0.206 | 0.493 | 0.508 |
| -1.000000000000085 | 0.205 | 0.494 | 0.512 |
| -0.995000000000085 | 0.204 | 0.494 | 0.517 |
| -0.990000000000085 | 0.204 | 0.495 | 0.522 |
| -0.985000000000085 | 0.203 | 0.495 | 0.526 |
| -0.980000000000085 | 0.202 | 0.495 | 0.531 |
| -0.975000000000085 | 0.202 | 0.496 | 0.536 |
| -0.970000000000085 | 0.201 | 0.496 | 0.54 |
| -0.965000000000085 | 0.2 | 0.497 | 0.545 |
| -0.960000000000085 | 0.2 | 0.497 | 0.55 |
| -0.955000000000085 | 0.199 | 0.497 | 0.555 |
| -0.950000000000085 | 0.198 | 0.498 | 0.56 |
| -0.945000000000085 | 0.198 | 0.498 | 0.564 |
| -0.940000000000085 | 0.197 | 0.498 | 0.569 |
| -0.935000000000085 | 0.196 | 0.499 | 0.574 |
| -0.930000000000085 | 0.196 | 0.499 | 0.579 |
| -0.925000000000085 | 0.195 | 0.499 | 0.584 |
| -0.920000000000085 | 0.194 | 0.499 | 0.589 |
| -0.915000000000085 | 0.193 | 0.499 | 0.594 |
| -0.910000000000085 | 0.193 | 0.5 | 0.599 |
| -0.905000000000085 | 0.192 | 0.5 | 0.604 |
| -0.900000000000085 | 0.191 | 0.5 | 0.609 |
| -0.895000000000085 | 0.191 | 0.5 | 0.614 |
| -0.890000000000085 | 0.19 | 0.5 | 0.62 |
| -0.885000000000085 | 0.189 | 0.5 | 0.625 |
| -0.880000000000085 | 0.188 | 0.5 | 0.63 |
| -0.875000000000085 | 0.188 | 0.5 | 0.635 |
| -0.870000000000085 | 0.187 | 0.5 | 0.64 |
| -0.865000000000085 | 0.186 | 0.5 | 0.646 |
| -0.860000000000085 | 0.185 | 0.5 | 0.651 |
| -0.855000000000085 | 0.184 | 0.5 | 0.656 |
| -0.850000000000085 | 0.184 | 0.499 | 0.661 |
| -0.845000000000085 | 0.183 | 0.499 | 0.667 |
| -0.840000000000085 | 0.182 | 0.499 | 0.672 |
| -0.835000000000085 | 0.181 | 0.499 | 0.677 |
| -0.830000000000085 | 0.181 | 0.499 | 0.683 |
| -0.825000000000085 | 0.18 | 0.498 | 0.688 |
| -0.820000000000085 | 0.179 | 0.498 | 0.694 |
| -0.815000000000085 | 0.178 | 0.498 | 0.699 |
| -0.810000000000085 | 0.177 | 0.497 | 0.704 |
| -0.805000000000085 | 0.177 | 0.497 | 0.71 |
| -0.800000000000085 | 0.176 | 0.497 | 0.715 |
| -0.795000000000085 | 0.175 | 0.496 | 0.721 |
| -0.790000000000085 | 0.174 | 0.496 | 0.726 |
| -0.785000000000085 | 0.173 | 0.495 | 0.731 |
| -0.780000000000085 | 0.172 | 0.494 | 0.737 |
| -0.775000000000085 | 0.172 | 0.494 | 0.742 |
| -0.770000000000085 | 0.171 | 0.493 | 0.748 |
| -0.765000000000085 | 0.17 | 0.493 | 0.753 |
| -0.760000000000085 | 0.169 | 0.492 | 0.759 |
| -0.755000000000085 | 0.168 | 0.491 | 0.764 |
| -0.750000000000085 | 0.167 | 0.491 | 0.77 |
| -0.745000000000085 | 0.166 | 0.49 | 0.775 |
| -0.740000000000085 | 0.166 | 0.489 | 0.78 |
| -0.735000000000085 | 0.165 | 0.488 | 0.786 |
| -0.730000000000085 | 0.164 | 0.487 | 0.791 |
| -0.725000000000085 | 0.163 | 0.486 | 0.797 |
| -0.720000000000085 | 0.162 | 0.486 | 0.802 |
| -0.715000000000085 | 0.161 | 0.485 | 0.807 |
| -0.710000000000085 | 0.16 | 0.484 | 0.813 |
| -0.705000000000085 | 0.159 | 0.483 | 0.818 |
| -0.700000000000085 | 0.158 | 0.482 | 0.823 |
| -0.695000000000085 | 0.157 | 0.48 | 0.829 |
| -0.690000000000085 | 0.157 | 0.479 | 0.834 |
| -0.685000000000085 | 0.156 | 0.478 | 0.839 |
| -0.680000000000085 | 0.155 | 0.477 | 0.844 |
| -0.675000000000085 | 0.154 | 0.476 | 0.849 |
| -0.670000000000085 | 0.153 | 0.474 | 0.854 |
| -0.665000000000085 | 0.152 | 0.473 | 0.859 |
| -0.660000000000085 | 0.151 | 0.472 | 0.865 |
| -0.655000000000085 | 0.15 | 0.47 | 0.869 |
| -0.650000000000085 | 0.149 | 0.469 | 0.874 |
| -0.645000000000085 | 0.148 | 0.468 | 0.879 |
| -0.640000000000085 | 0.147 | 0.466 | 0.884 |
| -0.635000000000085 | 0.146 | 0.465 | 0.889 |
| -0.630000000000085 | 0.145 | 0.463 | 0.894 |
| -0.625000000000085 | 0.144 | 0.461 | 0.898 |
| -0.620000000000085 | 0.143 | 0.46 | 0.903 |
| -0.615000000000085 | 0.142 | 0.458 | 0.908 |
| -0.610000000000085 | 0.141 | 0.457 | 0.912 |
| -0.605000000000085 | 0.14 | 0.455 | 0.916 |
| -0.600000000000085 | 0.139 | 0.453 | 0.921 |
| -0.595000000000085 | 0.138 | 0.451 | 0.925 |
| -0.590000000000085 | 0.137 | 0.449 | 0.929 |
| -0.585000000000085 | 0.136 | 0.448 | 0.933 |
| -0.580000000000085 | 0.135 | 0.446 | 0.937 |
| -0.575000000000085 | 0.134 | 0.444 | 0.941 |
| -0.570000000000085 | 0.133 | 0.442 | 0.945 |
| -0.565000000000085 | 0.132 | 0.44 | 0.949 |
| -0.560000000000085 | 0.131 | 0.438 | 0.953 |
| -0.555000000000085 | 0.13 | 0.435 | 0.956 |
| -0.550000000000085 | 0.129 | 0.433 | 0.96 |
| -0.545000000000085 | 0.128 | 0.431 | 0.963 |
| -0.540000000000085 | 0.127 | 0.429 | 0.966 |
| -0.535000000000085 | 0.126 | 0.427 | 0.969 |
| -0.530000000000085 | 0.125 | 0.424 | 0.972 |
| -0.525000000000085 | 0.124 | 0.422 | 0.975 |
| -0.520000000000085 | 0.123 | 0.42 | 0.978 |
| -0.515000000000085 | 0.122 | 0.417 | 0.98 |
| -0.510000000000085 | 0.121 | 0.415 | 0.983 |
| -0.505000000000085 | 0.12 | 0.412 | 0.985 |
| -0.500000000000085 | 0.119 | 0.41 | 0.987 |
| -0.495000000000085 | 0.118 | 0.407 | 0.989 |
| -0.490000000000085 | 0.117 | 0.405 | 0.991 |
| -0.485000000000085 | 0.116 | 0.402 | 0.993 |
| -0.480000000000085 | 0.114 | 0.399 | 0.994 |
| -0.475000000000085 | 0.113 | 0.397 | 0.996 |
| -0.470000000000085 | 0.112 | 0.394 | 0.997 |
| -0.465000000000085 | 0.111 | 0.391 | 0.998 |
| -0.460000000000085 | 0.11 | 0.388 | 0.999 |
| -0.455000000000085 | 0.109 | 0.385 | 0.999 |
| -0.450000000000085 | 0.108 | 0.383 | 1 |
| -0.445000000000085 | 0.107 | 0.38 | 1 |
| -0.440000000000085 | 0.106 | 0.377 | 1 |
| -0.435000000000085 | 0.105 | 0.374 | 1 |
| -0.430000000000085 | 0.103 | 0.371 | 1 |
| -0.425000000000085 | 0.102 | 0.367 | 0.999 |
| -0.420000000000085 | 0.101 | 0.364 | 0.998 |
| -0.415000000000085 | 0.1 | 0.361 | 0.997 |
| -0.410000000000085 | 0.099 | 0.358 | 0.996 |
| -0.405000000000085 | 0.098 | 0.355 | 0.995 |
| -0.400000000000085 | 0.097 | 0.351 | 0.993 |
| -0.395000000000085 | 0.096 | 0.348 | 0.991 |
| -0.390000000000085 | 0.094 | 0.345 | 0.989 |
| -0.385000000000085 | 0.093 | 0.341 | 0.987 |
| -0.380000000000085 | 0.092 | 0.338 | 0.984 |
| -0.375000000000085 | 0.091 | 0.335 | 0.981 |
| -0.370000000000085 | 0.09 | 0.331 | 0.978 |
| -0.365000000000085 | 0.089 | 0.328 | 0.975 |
| -0.360000000000085 | 0.088 | 0.324 | 0.971 |
| -0.355000000000085 | 0.086 | 0.32 | 0.967 |
| -0.350000000000085 | 0.085 | 0.317 | 0.963 |
| -0.345000000000085 | 0.084 | 0.313 | 0.959 |
| -0.340000000000085 | 0.083 | 0.309 | 0.954 |
| -0.335000000000085 | 0.082 | 0.306 | 0.949 |
| -0.330000000000085 | 0.081 | 0.302 | 0.944 |
| -0.325000000000085 | 0.079 | 0.298 | 0.938 |
| -0.320000000000085 | 0.078 | 0.294 | 0.932 |
| -0.315000000000085 | 0.077 | 0.29 | 0.926 |
| -0.310000000000085 | 0.076 | 0.287 | 0.92 |
| -0.305000000000085 | 0.075 | 0.283 | 0.913 |
| -0.300000000000085 | 0.074 | 0.279 | 0.906 |
| -0.295000000000085 | 0.072 | 0.275 | 0.899 |
| -0.290000000000085 | 0.071 | 0.271 | 0.891 |
| -0.285000000000085 | 0.07 | 0.267 | 0.883 |
| -0.280000000000085 | 0.069 | 0.263 | 0.875 |
| -0.275000000000085 | 0.068 | 0.258 | 0.867 |
| -0.270000000000085 | 0.066 | 0.254 | 0.858 |
| -0.265000000000085 | 0.065 | 0.25 | 0.849 |
| -0.260000000000085 | 0.064 | 0.246 | 0.839 |
| -0.255000000000085 | 0.063 | 0.242 | 0.83 |
| -0.250000000000085 | 0.062 | 0.237 | 0.82 |
| -0.245000000000085 | 0.06 | 0.233 | 0.809 |
| -0.240000000000085 | 0.059 | 0.229 | 0.799 |
| -0.235000000000085 | 0.058 | 0.225 | 0.788 |
| -0.230000000000085 | 0.057 | 0.22 | 0.777 |
| -0.225000000000085 | 0.056 | 0.216 | 0.765 |
| -0.220000000000085 | 0.054 | 0.211 | 0.753 |
| -0.215000000000085 | 0.053 | 0.207 | 0.741 |
| -0.210000000000085 | 0.052 | 0.202 | 0.729 |
| -0.205000000000085 | 0.051 | 0.198 | 0.716 |
| -0.200000000000085 | 0.05 | 0.193 | 0.703 |
| -0.195000000000085 | 0.048 | 0.189 | 0.69 |
| -0.190000000000085 | 0.047 | 0.184 | 0.676 |
| -0.185000000000085 | 0.046 | 0.18 | 0.662 |
| -0.180000000000085 | 0.045 | 0.175 | 0.648 |
| -0.175000000000085 | 0.043 | 0.171 | 0.634 |
| -0.170000000000085 | 0.042 | 0.166 | 0.619 |
| -0.165000000000085 | 0.041 | 0.161 | 0.604 |
| -0.160000000000085 | 0.04 | 0.157 | 0.589 |
| -0.155000000000084 | 0.039 | 0.152 | 0.573 |
| -0.150000000000084 | 0.037 | 0.147 | 0.557 |
| -0.145000000000084 | 0.036 | 0.142 | 0.541 |
| -0.140000000000084 | 0.035 | 0.138 | 0.525 |
| -0.135000000000084 | 0.034 | 0.133 | 0.509 |
| -0.130000000000084 | 0.032 | 0.128 | 0.492 |
| -0.125000000000084 | 0.031 | 0.123 | 0.475 |
| -0.120000000000084 | 0.03 | 0.119 | 0.458 |
| -0.115000000000084 | 0.029 | 0.114 | 0.44 |
| -0.110000000000084 | 0.027 | 0.109 | 0.423 |
| -0.105000000000084 | 0.026 | 0.104 | 0.405 |
| -0.100000000000084 | 0.025 | 0.099 | 0.387 |
| -0.0950000000000844 | 0.024 | 0.094 | 0.369 |
| -0.0900000000000844 | 0.022 | 0.089 | 0.35 |
| -0.0850000000000844 | 0.021 | 0.084 | 0.332 |
| -0.0800000000000844 | 0.02 | 0.08 | 0.313 |
| -0.0750000000000844 | 0.019 | 0.075 | 0.294 |
| -0.0700000000000844 | 0.017 | 0.07 | 0.275 |
| -0.0650000000000844 | 0.016 | 0.065 | 0.256 |
| -0.0600000000000844 | 0.015 | 0.06 | 0.237 |
| -0.0550000000000844 | 0.014 | 0.055 | 0.218 |
| -0.0500000000000844 | 0.012 | 0.05 | 0.198 |
| -0.0450000000000844 | 0.011 | 0.045 | 0.179 |
| -0.0400000000000844 | 0.01 | 0.04 | 0.159 |
| -0.0350000000000844 | 0.009 | 0.035 | 0.139 |
| -0.0300000000000844 | 0.007 | 0.03 | 0.12 |
| -0.0250000000000844 | 0.006 | 0.025 | 0.1 |
| -0.0200000000000844 | 0.005 | 0.02 | 0.08 |
| -0.0150000000000844 | 0.004 | 0.015 | 0.06 |
| -0.0100000000000844 | 0.002 | 0.01 | 0.04 |
| -0.00500000000008444 | 0.001 | 0.005 | 0.02 |
| -8.4444604087075e-14 | 0 | 0 | 0 |
| 0.00499999999991555 | -0.001 | -0.005 | -0.02 |
| 0.00999999999991555 | -0.002 | -0.01 | -0.04 |
| 0.0149999999999156 | -0.004 | -0.015 | -0.06 |
| 0.0199999999999156 | -0.005 | -0.02 | -0.08 |
| 0.0249999999999156 | -0.006 | -0.025 | -0.1 |
| 0.0299999999999156 | -0.007 | -0.03 | -0.12 |
| 0.0349999999999155 | -0.009 | -0.035 | -0.139 |
| 0.0399999999999155 | -0.01 | -0.04 | -0.159 |
| 0.0449999999999155 | -0.011 | -0.045 | -0.179 |
| 0.0499999999999155 | -0.012 | -0.05 | -0.198 |
| 0.0549999999999155 | -0.014 | -0.055 | -0.218 |
| 0.0599999999999155 | -0.015 | -0.06 | -0.237 |
| 0.0649999999999155 | -0.016 | -0.065 | -0.256 |
| 0.0699999999999155 | -0.017 | -0.07 | -0.275 |
| 0.0749999999999155 | -0.019 | -0.075 | -0.294 |
| 0.0799999999999155 | -0.02 | -0.08 | -0.313 |
| 0.0849999999999155 | -0.021 | -0.084 | -0.332 |
| 0.0899999999999155 | -0.022 | -0.089 | -0.35 |
| 0.0949999999999155 | -0.024 | -0.094 | -0.369 |
| 0.0999999999999155 | -0.025 | -0.099 | -0.387 |
| 0.104999999999916 | -0.026 | -0.104 | -0.405 |
| 0.109999999999916 | -0.027 | -0.109 | -0.423 |
| 0.114999999999916 | -0.029 | -0.114 | -0.44 |
| 0.119999999999916 | -0.03 | -0.119 | -0.458 |
| 0.124999999999916 | -0.031 | -0.123 | -0.475 |
| 0.129999999999916 | -0.032 | -0.128 | -0.492 |
| 0.134999999999916 | -0.034 | -0.133 | -0.509 |
| 0.139999999999916 | -0.035 | -0.138 | -0.525 |
| 0.144999999999916 | -0.036 | -0.142 | -0.541 |
| 0.149999999999916 | -0.037 | -0.147 | -0.557 |
| 0.154999999999916 | -0.039 | -0.152 | -0.573 |
| 0.159999999999916 | -0.04 | -0.157 | -0.589 |
| 0.164999999999916 | -0.041 | -0.161 | -0.604 |
| 0.169999999999916 | -0.042 | -0.166 | -0.619 |
| 0.174999999999916 | -0.043 | -0.171 | -0.634 |
| 0.179999999999916 | -0.045 | -0.175 | -0.648 |
| 0.184999999999916 | -0.046 | -0.18 | -0.662 |
| 0.189999999999916 | -0.047 | -0.184 | -0.676 |
| 0.194999999999916 | -0.048 | -0.189 | -0.69 |
| 0.199999999999916 | -0.05 | -0.193 | -0.703 |
| 0.204999999999916 | -0.051 | -0.198 | -0.716 |
| 0.209999999999916 | -0.052 | -0.202 | -0.729 |
| 0.214999999999916 | -0.053 | -0.207 | -0.741 |
| 0.219999999999916 | -0.054 | -0.211 | -0.753 |
| 0.224999999999916 | -0.056 | -0.216 | -0.765 |
| 0.229999999999916 | -0.057 | -0.22 | -0.777 |
| 0.234999999999916 | -0.058 | -0.225 | -0.788 |
| 0.239999999999916 | -0.059 | -0.229 | -0.799 |
| 0.244999999999916 | -0.06 | -0.233 | -0.809 |
| 0.249999999999916 | -0.062 | -0.237 | -0.82 |
| 0.254999999999916 | -0.063 | -0.242 | -0.83 |
| 0.259999999999916 | -0.064 | -0.246 | -0.839 |
| 0.264999999999916 | -0.065 | -0.25 | -0.849 |
| 0.269999999999916 | -0.066 | -0.254 | -0.858 |
| 0.274999999999916 | -0.068 | -0.258 | -0.867 |
| 0.279999999999916 | -0.069 | -0.263 | -0.875 |
| 0.284999999999916 | -0.07 | -0.267 | -0.883 |
| 0.289999999999916 | -0.071 | -0.271 | -0.891 |
| 0.294999999999916 | -0.072 | -0.275 | -0.899 |
| 0.299999999999916 | -0.074 | -0.279 | -0.906 |
| 0.304999999999916 | -0.075 | -0.283 | -0.913 |
| 0.309999999999916 | -0.076 | -0.287 | -0.92 |
| 0.314999999999916 | -0.077 | -0.29 | -0.926 |
| 0.319999999999916 | -0.078 | -0.294 | -0.932 |
| 0.324999999999916 | -0.079 | -0.298 | -0.938 |
| 0.329999999999916 | -0.081 | -0.302 | -0.944 |
| 0.334999999999916 | -0.082 | -0.306 | -0.949 |
| 0.339999999999916 | -0.083 | -0.309 | -0.954 |
| 0.344999999999916 | -0.084 | -0.313 | -0.959 |
| 0.349999999999916 | -0.085 | -0.317 | -0.963 |
| 0.354999999999916 | -0.086 | -0.32 | -0.967 |
| 0.359999999999916 | -0.088 | -0.324 | -0.971 |
| 0.364999999999916 | -0.089 | -0.328 | -0.975 |
| 0.369999999999916 | -0.09 | -0.331 | -0.978 |
| 0.374999999999916 | -0.091 | -0.335 | -0.981 |
| 0.379999999999916 | -0.092 | -0.338 | -0.984 |
| 0.384999999999916 | -0.093 | -0.341 | -0.987 |
| 0.389999999999916 | -0.094 | -0.345 | -0.989 |
| 0.394999999999916 | -0.096 | -0.348 | -0.991 |
| 0.399999999999916 | -0.097 | -0.351 | -0.993 |
| 0.404999999999916 | -0.098 | -0.355 | -0.995 |
| 0.409999999999916 | -0.099 | -0.358 | -0.996 |
| 0.414999999999916 | -0.1 | -0.361 | -0.997 |
| 0.419999999999916 | -0.101 | -0.364 | -0.998 |
| 0.424999999999916 | -0.102 | -0.367 | -0.999 |
| 0.429999999999916 | -0.103 | -0.371 | -1 |
| 0.434999999999916 | -0.105 | -0.374 | -1 |
| 0.439999999999916 | -0.106 | -0.377 | -1 |
| 0.444999999999916 | -0.107 | -0.38 | -1 |
| 0.449999999999916 | -0.108 | -0.383 | -1 |
| 0.454999999999916 | -0.109 | -0.385 | -0.999 |
| 0.459999999999916 | -0.11 | -0.388 | -0.999 |
| 0.464999999999916 | -0.111 | -0.391 | -0.998 |
| 0.469999999999916 | -0.112 | -0.394 | -0.997 |
| 0.474999999999916 | -0.113 | -0.397 | -0.996 |
| 0.479999999999916 | -0.114 | -0.399 | -0.994 |
| 0.484999999999916 | -0.116 | -0.402 | -0.993 |
| 0.489999999999916 | -0.117 | -0.405 | -0.991 |
| 0.494999999999916 | -0.118 | -0.407 | -0.989 |
| 0.499999999999916 | -0.119 | -0.41 | -0.987 |
| 0.504999999999916 | -0.12 | -0.412 | -0.985 |
| 0.509999999999916 | -0.121 | -0.415 | -0.983 |
| 0.514999999999916 | -0.122 | -0.417 | -0.98 |
| 0.519999999999916 | -0.123 | -0.42 | -0.978 |
| 0.524999999999916 | -0.124 | -0.422 | -0.975 |
| 0.529999999999916 | -0.125 | -0.424 | -0.972 |
| 0.534999999999916 | -0.126 | -0.427 | -0.969 |
| 0.539999999999916 | -0.127 | -0.429 | -0.966 |
| 0.544999999999916 | -0.128 | -0.431 | -0.963 |
| 0.549999999999916 | -0.129 | -0.433 | -0.96 |
| 0.554999999999916 | -0.13 | -0.435 | -0.956 |
| 0.559999999999916 | -0.131 | -0.438 | -0.953 |
| 0.564999999999916 | -0.132 | -0.44 | -0.949 |
| 0.569999999999916 | -0.133 | -0.442 | -0.945 |
| 0.574999999999916 | -0.134 | -0.444 | -0.941 |
| 0.579999999999916 | -0.135 | -0.446 | -0.937 |
| 0.584999999999916 | -0.136 | -0.448 | -0.933 |
| 0.589999999999916 | -0.137 | -0.449 | -0.929 |
| 0.594999999999916 | -0.138 | -0.451 | -0.925 |
| 0.599999999999916 | -0.139 | -0.453 | -0.921 |
| 0.604999999999916 | -0.14 | -0.455 | -0.916 |
| 0.609999999999916 | -0.141 | -0.457 | -0.912 |
| 0.614999999999916 | -0.142 | -0.458 | -0.908 |
| 0.619999999999916 | -0.143 | -0.46 | -0.903 |
| 0.624999999999916 | -0.144 | -0.461 | -0.898 |
| 0.629999999999916 | -0.145 | -0.463 | -0.894 |
| 0.634999999999916 | -0.146 | -0.465 | -0.889 |
| 0.639999999999916 | -0.147 | -0.466 | -0.884 |
| 0.644999999999916 | -0.148 | -0.468 | -0.879 |
| 0.649999999999916 | -0.149 | -0.469 | -0.874 |
| 0.654999999999916 | -0.15 | -0.47 | -0.869 |
| 0.659999999999916 | -0.151 | -0.472 | -0.865 |
| 0.664999999999916 | -0.152 | -0.473 | -0.859 |
| 0.669999999999916 | -0.153 | -0.474 | -0.854 |
| 0.674999999999916 | -0.154 | -0.476 | -0.849 |
| 0.679999999999916 | -0.155 | -0.477 | -0.844 |
| 0.684999999999916 | -0.156 | -0.478 | -0.839 |
| 0.689999999999916 | -0.157 | -0.479 | -0.834 |
| 0.694999999999916 | -0.157 | -0.48 | -0.829 |
| 0.699999999999916 | -0.158 | -0.482 | -0.823 |
| 0.704999999999916 | -0.159 | -0.483 | -0.818 |
| 0.709999999999916 | -0.16 | -0.484 | -0.813 |
| 0.714999999999916 | -0.161 | -0.485 | -0.807 |
| 0.719999999999916 | -0.162 | -0.486 | -0.802 |
| 0.724999999999916 | -0.163 | -0.486 | -0.797 |
| 0.729999999999916 | -0.164 | -0.487 | -0.791 |
| 0.734999999999916 | -0.165 | -0.488 | -0.786 |
| 0.739999999999916 | -0.166 | -0.489 | -0.78 |
| 0.744999999999916 | -0.166 | -0.49 | -0.775 |
| 0.749999999999916 | -0.167 | -0.491 | -0.77 |
| 0.754999999999916 | -0.168 | -0.491 | -0.764 |
| 0.759999999999916 | -0.169 | -0.492 | -0.759 |
| 0.764999999999916 | -0.17 | -0.493 | -0.753 |
| 0.769999999999916 | -0.171 | -0.493 | -0.748 |
| 0.774999999999916 | -0.172 | -0.494 | -0.742 |
| 0.779999999999916 | -0.172 | -0.494 | -0.737 |
| 0.784999999999916 | -0.173 | -0.495 | -0.731 |
| 0.789999999999916 | -0.174 | -0.496 | -0.726 |
| 0.794999999999916 | -0.175 | -0.496 | -0.721 |
| 0.799999999999916 | -0.176 | -0.497 | -0.715 |
| 0.804999999999916 | -0.177 | -0.497 | -0.71 |
| 0.809999999999916 | -0.177 | -0.497 | -0.704 |
| 0.814999999999916 | -0.178 | -0.498 | -0.699 |
| 0.819999999999916 | -0.179 | -0.498 | -0.694 |
| 0.824999999999916 | -0.18 | -0.498 | -0.688 |
| 0.829999999999916 | -0.181 | -0.499 | -0.683 |
| 0.834999999999916 | -0.181 | -0.499 | -0.677 |
| 0.839999999999916 | -0.182 | -0.499 | -0.672 |
| 0.844999999999916 | -0.183 | -0.499 | -0.667 |
| 0.849999999999916 | -0.184 | -0.499 | -0.661 |
| 0.854999999999916 | -0.184 | -0.5 | -0.656 |
| 0.859999999999916 | -0.185 | -0.5 | -0.651 |
| 0.864999999999916 | -0.186 | -0.5 | -0.646 |
| 0.869999999999916 | -0.187 | -0.5 | -0.64 |
| 0.874999999999916 | -0.188 | -0.5 | -0.635 |
| 0.879999999999916 | -0.188 | -0.5 | -0.63 |
| 0.884999999999916 | -0.189 | -0.5 | -0.625 |
| 0.889999999999916 | -0.19 | -0.5 | -0.62 |
| 0.894999999999916 | -0.191 | -0.5 | -0.614 |
| 0.899999999999916 | -0.191 | -0.5 | -0.609 |
| 0.904999999999916 | -0.192 | -0.5 | -0.604 |
| 0.909999999999916 | -0.193 | -0.5 | -0.599 |
| 0.914999999999916 | -0.193 | -0.499 | -0.594 |
| 0.919999999999916 | -0.194 | -0.499 | -0.589 |
| 0.924999999999916 | -0.195 | -0.499 | -0.584 |
| 0.929999999999916 | -0.196 | -0.499 | -0.579 |
| 0.934999999999916 | -0.196 | -0.499 | -0.574 |
| 0.939999999999916 | -0.197 | -0.498 | -0.569 |
| 0.944999999999916 | -0.198 | -0.498 | -0.564 |
| 0.949999999999916 | -0.198 | -0.498 | -0.56 |
| 0.954999999999916 | -0.199 | -0.497 | -0.555 |
| 0.959999999999916 | -0.2 | -0.497 | -0.55 |
| 0.964999999999916 | -0.2 | -0.497 | -0.545 |
| 0.969999999999916 | -0.201 | -0.496 | -0.54 |
| 0.974999999999916 | -0.202 | -0.496 | -0.536 |
| 0.979999999999916 | -0.202 | -0.495 | -0.531 |
| 0.984999999999916 | -0.203 | -0.495 | -0.526 |
| 0.989999999999916 | -0.204 | -0.495 | -0.522 |
| 0.994999999999916 | -0.204 | -0.494 | -0.517 |
| 0.999999999999916 | -0.205 | -0.494 | -0.512 |
| 1.004999999999916 | -0.206 | -0.493 | -0.508 |
| 1.009999999999916 | -0.206 | -0.492 | -0.503 |
| 1.014999999999916 | -0.207 | -0.492 | -0.499 |
| 1.019999999999916 | -0.207 | -0.491 | -0.494 |
| 1.024999999999916 | -0.208 | -0.491 | -0.49 |
| 1.029999999999916 | -0.209 | -0.49 | -0.486 |
| 1.034999999999916 | -0.209 | -0.489 | -0.481 |
| 1.039999999999915 | -0.21 | -0.489 | -0.477 |
| 1.044999999999915 | -0.21 | -0.488 | -0.473 |
| 1.049999999999915 | -0.211 | -0.487 | -0.468 |
| 1.054999999999915 | -0.212 | -0.487 | -0.464 |
| 1.059999999999915 | -0.212 | -0.486 | -0.46 |
| 1.064999999999915 | -0.213 | -0.485 | -0.456 |
| 1.069999999999915 | -0.213 | -0.485 | -0.452 |
| 1.074999999999915 | -0.214 | -0.484 | -0.447 |
| 1.079999999999915 | -0.214 | -0.483 | -0.443 |
| 1.084999999999914 | -0.215 | -0.482 | -0.439 |
| 1.089999999999914 | -0.216 | -0.481 | -0.435 |
| 1.094999999999914 | -0.216 | -0.481 | -0.431 |
| 1.099999999999914 | -0.217 | -0.48 | -0.427 |
| 1.104999999999914 | -0.217 | -0.479 | -0.423 |
| 1.109999999999914 | -0.218 | -0.478 | -0.419 |
| 1.114999999999914 | -0.218 | -0.477 | -0.415 |
| 1.119999999999914 | -0.219 | -0.476 | -0.412 |
| 1.124999999999914 | -0.219 | -0.475 | -0.408 |
| 1.129999999999914 | -0.22 | -0.474 | -0.404 |
| 1.134999999999913 | -0.22 | -0.474 | -0.4 |
| 1.139999999999913 | -0.221 | -0.473 | -0.397 |
| 1.144999999999913 | -0.221 | -0.472 | -0.393 |
| 1.149999999999913 | -0.222 | -0.471 | -0.389 |
| 1.154999999999913 | -0.222 | -0.47 | -0.385 |
| 1.159999999999913 | -0.223 | -0.469 | -0.382 |
| 1.164999999999913 | -0.223 | -0.468 | -0.378 |
| 1.169999999999913 | -0.224 | -0.467 | -0.375 |
| 1.174999999999913 | -0.224 | -0.466 | -0.371 |
| 1.179999999999912 | -0.225 | -0.465 | -0.368 |
| 1.184999999999912 | -0.225 | -0.464 | -0.364 |
| 1.189999999999912 | -0.226 | -0.463 | -0.361 |
| 1.194999999999912 | -0.226 | -0.461 | -0.357 |
| 1.199999999999912 | -0.227 | -0.46 | -0.354 |
| 1.204999999999912 | -0.227 | -0.459 | -0.351 |
| 1.209999999999912 | -0.227 | -0.458 | -0.347 |
| 1.214999999999912 | -0.228 | -0.457 | -0.344 |
| 1.219999999999912 | -0.228 | -0.456 | -0.341 |
| 1.224999999999911 | -0.229 | -0.455 | -0.338 |
| 1.229999999999911 | -0.229 | -0.454 | -0.334 |
| 1.234999999999911 | -0.23 | -0.453 | -0.331 |
| 1.239999999999911 | -0.23 | -0.452 | -0.328 |
| 1.244999999999911 | -0.23 | -0.45 | -0.325 |
| 1.249999999999911 | -0.231 | -0.449 | -0.322 |
| 1.254999999999911 | -0.231 | -0.448 | -0.319 |
| 1.259999999999911 | -0.232 | -0.447 | -0.316 |
| 1.264999999999911 | -0.232 | -0.446 | -0.313 |
| 1.269999999999911 | -0.232 | -0.444 | -0.31 |
| 1.27499999999991 | -0.233 | -0.443 | -0.307 |
| 1.27999999999991 | -0.233 | -0.442 | -0.304 |
| 1.28499999999991 | -0.233 | -0.441 | -0.301 |
| 1.28999999999991 | -0.234 | -0.44 | -0.298 |
| 1.29499999999991 | -0.234 | -0.438 | -0.295 |
| 1.29999999999991 | -0.235 | -0.437 | -0.292 |
| 1.30499999999991 | -0.235 | -0.436 | -0.289 |
| 1.30999999999991 | -0.235 | -0.435 | -0.287 |
| 1.31499999999991 | -0.236 | -0.434 | -0.284 |
| 1.319999999999909 | -0.236 | -0.432 | -0.281 |
| 1.324999999999909 | -0.236 | -0.431 | -0.278 |
| 1.329999999999909 | -0.237 | -0.43 | -0.276 |
| 1.334999999999909 | -0.237 | -0.428 | -0.273 |
| 1.339999999999909 | -0.237 | -0.427 | -0.27 |
| 1.344999999999909 | -0.238 | -0.426 | -0.268 |
| 1.349999999999909 | -0.238 | -0.425 | -0.265 |
| 1.354999999999909 | -0.238 | -0.423 | -0.263 |
| 1.359999999999909 | -0.238 | -0.422 | -0.26 |
| 1.364999999999908 | -0.239 | -0.421 | -0.258 |
| 1.369999999999908 | -0.239 | -0.419 | -0.255 |
| 1.374999999999908 | -0.239 | -0.418 | -0.253 |
| 1.379999999999908 | -0.24 | -0.417 | -0.25 |
| 1.384999999999908 | -0.24 | -0.416 | -0.248 |
| 1.389999999999908 | -0.24 | -0.414 | -0.245 |
| 1.394999999999908 | -0.24 | -0.413 | -0.243 |
| 1.399999999999908 | -0.241 | -0.412 | -0.241 |
| 1.404999999999908 | -0.241 | -0.41 | -0.238 |
| 1.409999999999908 | -0.241 | -0.409 | -0.236 |
| 1.414999999999907 | -0.242 | -0.408 | -0.234 |
| 1.419999999999907 | -0.242 | -0.406 | -0.231 |
| 1.424999999999907 | -0.242 | -0.405 | -0.229 |
| 1.429999999999907 | -0.242 | -0.404 | -0.227 |
| 1.434999999999907 | -0.243 | -0.402 | -0.225 |
| 1.439999999999907 | -0.243 | -0.401 | -0.222 |
| 1.444999999999907 | -0.243 | -0.4 | -0.22 |
| 1.449999999999907 | -0.243 | -0.398 | -0.218 |
| 1.454999999999907 | -0.243 | -0.397 | -0.216 |
| 1.459999999999906 | -0.244 | -0.396 | -0.214 |
| 1.464999999999906 | -0.244 | -0.394 | -0.212 |
| 1.469999999999906 | -0.244 | -0.393 | -0.21 |
| 1.474999999999906 | -0.244 | -0.392 | -0.208 |
| 1.479999999999906 | -0.245 | -0.39 | -0.206 |
| 1.484999999999906 | -0.245 | -0.389 | -0.204 |
| 1.489999999999906 | -0.245 | -0.387 | -0.202 |
| 1.494999999999906 | -0.245 | -0.386 | -0.2 |
| 1.499999999999906 | -0.245 | -0.385 | -0.198 |
| 1.504999999999906 | -0.245 | -0.383 | -0.196 |
| 1.509999999999905 | -0.246 | -0.382 | -0.194 |
| 1.514999999999905 | -0.246 | -0.381 | -0.192 |
| 1.519999999999905 | -0.246 | -0.379 | -0.19 |
| 1.524999999999905 | -0.246 | -0.378 | -0.188 |
| 1.529999999999905 | -0.246 | -0.377 | -0.186 |
| 1.534999999999905 | -0.247 | -0.375 | -0.184 |
| 1.539999999999905 | -0.247 | -0.374 | -0.183 |
| 1.544999999999905 | -0.247 | -0.373 | -0.181 |
| 1.549999999999905 | -0.247 | -0.371 | -0.179 |
| 1.554999999999904 | -0.247 | -0.37 | -0.177 |
| 1.559999999999904 | -0.247 | -0.368 | -0.176 |
| 1.564999999999904 | -0.247 | -0.367 | -0.174 |
| 1.569999999999904 | -0.248 | -0.366 | -0.172 |
| 1.574999999999904 | -0.248 | -0.364 | -0.17 |
| 1.579999999999904 | -0.248 | -0.363 | -0.169 |
| 1.584999999999904 | -0.248 | -0.362 | -0.167 |
| 1.589999999999904 | -0.248 | -0.36 | -0.165 |
| 1.594999999999904 | -0.248 | -0.359 | -0.164 |
| 1.599999999999903 | -0.248 | -0.358 | -0.162 |
| 1.604999999999903 | -0.248 | -0.356 | -0.161 |
| 1.609999999999903 | -0.248 | -0.355 | -0.159 |
| 1.614999999999903 | -0.249 | -0.354 | -0.157 |
| 1.619999999999903 | -0.249 | -0.352 | -0.156 |
| 1.624999999999903 | -0.249 | -0.351 | -0.154 |
| 1.629999999999903 | -0.249 | -0.349 | -0.153 |
| 1.634999999999903 | -0.249 | -0.348 | -0.151 |
| 1.639999999999903 | -0.249 | -0.347 | -0.15 |
| 1.644999999999902 | -0.249 | -0.345 | -0.148 |
| 1.649999999999902 | -0.249 | -0.344 | -0.147 |
| 1.654999999999902 | -0.249 | -0.343 | -0.145 |
| 1.659999999999902 | -0.249 | -0.341 | -0.144 |
| 1.664999999999902 | -0.249 | -0.34 | -0.143 |
| 1.669999999999902 | -0.249 | -0.339 | -0.141 |
| 1.674999999999902 | -0.25 | -0.337 | -0.14 |
| 1.679999999999902 | -0.25 | -0.336 | -0.138 |
| 1.684999999999902 | -0.25 | -0.335 | -0.137 |
| 1.689999999999901 | -0.25 | -0.333 | -0.136 |
| 1.694999999999901 | -0.25 | -0.332 | -0.134 |
| 1.699999999999901 | -0.25 | -0.331 | -0.133 |
| 1.704999999999901 | -0.25 | -0.329 | -0.132 |
| 1.709999999999901 | -0.25 | -0.328 | -0.13 |
| 1.714999999999901 | -0.25 | -0.327 | -0.129 |
| 1.719999999999901 | -0.25 | -0.325 | -0.128 |
| 1.724999999999901 | -0.25 | -0.324 | -0.127 |
| 1.729999999999901 | -0.25 | -0.323 | -0.125 |
| 1.734999999999901 | -0.25 | -0.322 | -0.124 |
| 1.7399999999999 | -0.25 | -0.32 | -0.123 |
| 1.7449999999999 | -0.25 | -0.319 | -0.122 |
| 1.7499999999999 | -0.25 | -0.318 | -0.12 |
| 1.7549999999999 | -0.25 | -0.316 | -0.119 |
| 1.7599999999999 | -0.25 | -0.315 | -0.118 |
| 1.7649999999999 | -0.25 | -0.314 | -0.117 |
| 1.7699999999999 | -0.25 | -0.312 | -0.116 |
| 1.7749999999999 | -0.25 | -0.311 | -0.115 |
| 1.7799999999999 | -0.25 | -0.31 | -0.113 |
| 1.784999999999899 | -0.25 | -0.309 | -0.112 |
| 1.789999999999899 | -0.25 | -0.307 | -0.111 |
| 1.794999999999899 | -0.25 | -0.306 | -0.11 |
| 1.799999999999899 | -0.25 | -0.305 | -0.109 |
| 1.804999999999899 | -0.25 | -0.303 | -0.108 |
| 1.809999999999899 | -0.25 | -0.302 | -0.107 |
| 1.814999999999899 | -0.25 | -0.301 | -0.106 |
| 1.819999999999899 | -0.25 | -0.3 | -0.105 |
| 1.824999999999899 | -0.25 | -0.298 | -0.104 |
| 1.829999999999899 | -0.25 | -0.297 | -0.103 |
| 1.834999999999898 | -0.25 | -0.296 | -0.102 |
| 1.839999999999898 | -0.25 | -0.295 | -0.101 |
| 1.844999999999898 | -0.25 | -0.293 | -0.1 |
| 1.849999999999898 | -0.25 | -0.292 | -0.099 |
| 1.854999999999898 | -0.249 | -0.291 | -0.098 |
| 1.859999999999898 | -0.249 | -0.29 | -0.097 |
| 1.864999999999898 | -0.249 | -0.288 | -0.096 |
| 1.869999999999898 | -0.249 | -0.287 | -0.095 |
| 1.874999999999898 | -0.249 | -0.286 | -0.094 |
| 1.879999999999897 | -0.249 | -0.285 | -0.093 |
| 1.884999999999897 | -0.249 | -0.283 | -0.092 |
| 1.889999999999897 | -0.249 | -0.282 | -0.091 |
| 1.894999999999897 | -0.249 | -0.281 | -0.09 |
| 1.899999999999897 | -0.249 | -0.28 | -0.089 |
| 1.904999999999897 | -0.249 | -0.279 | -0.088 |
| 1.909999999999897 | -0.249 | -0.277 | -0.088 |
| 1.914999999999897 | -0.249 | -0.276 | -0.087 |
| 1.919999999999897 | -0.249 | -0.275 | -0.086 |
| 1.924999999999897 | -0.248 | -0.274 | -0.085 |
| 1.929999999999896 | -0.248 | -0.273 | -0.084 |
| 1.934999999999896 | -0.248 | -0.271 | -0.083 |
| 1.939999999999896 | -0.248 | -0.27 | -0.082 |
| 1.944999999999896 | -0.248 | -0.269 | -0.082 |
| 1.949999999999896 | -0.248 | -0.268 | -0.081 |
| 1.954999999999896 | -0.248 | -0.267 | -0.08 |
| 1.959999999999896 | -0.248 | -0.265 | -0.079 |
| 1.964999999999896 | -0.248 | -0.264 | -0.078 |
| 1.969999999999896 | -0.248 | -0.263 | -0.078 |
| 1.974999999999895 | -0.247 | -0.262 | -0.077 |
| 1.979999999999895 | -0.247 | -0.261 | -0.076 |
| 1.984999999999895 | -0.247 | -0.26 | -0.075 |
| 1.989999999999895 | -0.247 | -0.259 | -0.075 |
| 1.994999999999895 | -0.247 | -0.257 | -0.074 |
| 1.999999999999895 | -0.247 | -0.256 | -0.073 |
| 2.004999999999895 | -0.247 | -0.255 | -0.072 |
| 2.009999999999895 | -0.247 | -0.254 | -0.072 |
| 2.014999999999895 | -0.246 | -0.253 | -0.071 |
| 2.019999999999895 | -0.246 | -0.252 | -0.07 |
| 2.024999999999895 | -0.246 | -0.251 | -0.07 |
| 2.029999999999895 | -0.246 | -0.249 | -0.069 |
| 2.034999999999894 | -0.246 | -0.248 | -0.068 |
| 2.039999999999894 | -0.246 | -0.247 | -0.068 |
| 2.044999999999894 | -0.246 | -0.246 | -0.067 |
| 2.049999999999894 | -0.245 | -0.245 | -0.066 |
| 2.054999999999894 | -0.245 | -0.244 | -0.066 |
| 2.059999999999894 | -0.245 | -0.243 | -0.065 |
| 2.064999999999894 | -0.245 | -0.242 | -0.064 |
| 2.069999999999894 | -0.245 | -0.241 | -0.064 |
| 2.074999999999894 | -0.245 | -0.24 | -0.063 |
| 2.079999999999893 | -0.244 | -0.238 | -0.062 |
| 2.084999999999893 | -0.244 | -0.237 | -0.062 |
| 2.089999999999893 | -0.244 | -0.236 | -0.061 |
| 2.094999999999893 | -0.244 | -0.235 | -0.061 |
| 2.099999999999893 | -0.244 | -0.234 | -0.06 |
| 2.104999999999893 | -0.244 | -0.233 | -0.059 |
| 2.109999999999893 | -0.243 | -0.232 | -0.059 |
| 2.114999999999893 | -0.243 | -0.231 | -0.058 |
| 2.119999999999893 | -0.243 | -0.23 | -0.058 |
| 2.124999999999893 | -0.243 | -0.229 | -0.057 |
| 2.129999999999892 | -0.243 | -0.228 | -0.056 |
| 2.134999999999892 | -0.242 | -0.227 | -0.056 |
| 2.139999999999892 | -0.242 | -0.226 | -0.055 |
| 2.144999999999892 | -0.242 | -0.225 | -0.055 |
| 2.149999999999892 | -0.242 | -0.224 | -0.054 |
| 2.154999999999892 | -0.242 | -0.223 | -0.054 |
| 2.159999999999892 | -0.242 | -0.222 | -0.053 |
| 2.164999999999892 | -0.241 | -0.221 | -0.053 |
| 2.169999999999892 | -0.241 | -0.22 | -0.052 |
| 2.174999999999891 | -0.241 | -0.219 | -0.052 |
| 2.179999999999891 | -0.241 | -0.218 | -0.051 |
| 2.184999999999891 | -0.241 | -0.217 | -0.051 |
| 2.189999999999891 | -0.24 | -0.216 | -0.05 |
| 2.194999999999891 | -0.24 | -0.215 | -0.05 |
| 2.199999999999891 | -0.24 | -0.214 | -0.049 |
| 2.204999999999891 | -0.24 | -0.213 | -0.049 |
| 2.209999999999891 | -0.239 | -0.212 | -0.048 |
| 2.214999999999891 | -0.239 | -0.211 | -0.048 |
| 2.21999999999989 | -0.239 | -0.21 | -0.047 |
| 2.22499999999989 | -0.239 | -0.209 | -0.047 |
| 2.22999999999989 | -0.239 | -0.208 | -0.046 |
| 2.23499999999989 | -0.238 | -0.207 | -0.046 |
| 2.23999999999989 | -0.238 | -0.206 | -0.045 |
| 2.24499999999989 | -0.238 | -0.205 | -0.045 |
| 2.24999999999989 | -0.238 | -0.204 | -0.044 |
| 2.25499999999989 | -0.237 | -0.203 | -0.044 |
| 2.25999999999989 | -0.237 | -0.202 | -0.044 |
| 2.26499999999989 | -0.237 | -0.201 | -0.043 |
| 2.269999999999889 | -0.237 | -0.2 | -0.043 |
| 2.274999999999889 | -0.237 | -0.199 | -0.042 |
| 2.279999999999889 | -0.236 | -0.198 | -0.042 |
| 2.284999999999889 | -0.236 | -0.197 | -0.041 |
| 2.289999999999889 | -0.236 | -0.196 | -0.041 |
| 2.294999999999889 | -0.236 | -0.195 | -0.041 |
| 2.299999999999889 | -0.235 | -0.195 | -0.04 |
| 2.304999999999889 | -0.235 | -0.194 | -0.04 |
| 2.309999999999889 | -0.235 | -0.193 | -0.039 |
| 2.314999999999888 | -0.235 | -0.192 | -0.039 |
| 2.319999999999888 | -0.234 | -0.191 | -0.039 |
| 2.324999999999888 | -0.234 | -0.19 | -0.038 |
| 2.329999999999888 | -0.234 | -0.189 | -0.038 |
| 2.334999999999888 | -0.234 | -0.188 | -0.037 |
| 2.339999999999888 | -0.233 | -0.187 | -0.037 |
| 2.344999999999888 | -0.233 | -0.186 | -0.037 |
| 2.349999999999888 | -0.233 | -0.186 | -0.036 |
| 2.354999999999888 | -0.233 | -0.185 | -0.036 |
| 2.359999999999887 | -0.232 | -0.184 | -0.036 |
| 2.364999999999887 | -0.232 | -0.183 | -0.035 |
| 2.369999999999887 | -0.232 | -0.182 | -0.035 |
| 2.374999999999887 | -0.232 | -0.181 | -0.035 |
| 2.379999999999887 | -0.231 | -0.18 | -0.034 |
| 2.384999999999887 | -0.231 | -0.18 | -0.034 |
| 2.389999999999887 | -0.231 | -0.179 | -0.034 |
| 2.394999999999887 | -0.23 | -0.178 | -0.033 |
| 2.399999999999887 | -0.23 | -0.177 | -0.033 |
| 2.404999999999887 | -0.23 | -0.176 | -0.033 |
| 2.409999999999886 | -0.23 | -0.175 | -0.032 |
| 2.414999999999886 | -0.229 | -0.175 | -0.032 |
| 2.419999999999886 | -0.229 | -0.174 | -0.032 |
| 2.424999999999886 | -0.229 | -0.173 | -0.031 |
| 2.429999999999886 | -0.229 | -0.172 | -0.031 |
| 2.434999999999886 | -0.228 | -0.171 | -0.031 |
| 2.439999999999886 | -0.228 | -0.17 | -0.03 |
| 2.444999999999886 | -0.228 | -0.17 | -0.03 |
| 2.449999999999886 | -0.227 | -0.169 | -0.03 |
| 2.454999999999885 | -0.227 | -0.168 | -0.029 |
| 2.459999999999885 | -0.227 | -0.167 | -0.029 |
| 2.464999999999885 | -0.227 | -0.166 | -0.029 |
| 2.469999999999885 | -0.226 | -0.166 | -0.029 |
| 2.474999999999885 | -0.226 | -0.165 | -0.028 |
| 2.479999999999885 | -0.226 | -0.164 | -0.028 |
| 2.484999999999885 | -0.225 | -0.163 | -0.028 |
| 2.489999999999885 | -0.225 | -0.162 | -0.027 |
| 2.494999999999885 | -0.225 | -0.162 | -0.027 |
| 2.499999999999884 | -0.225 | -0.161 | -0.027 |
| 2.504999999999884 | -0.224 | -0.16 | -0.027 |
| 2.509999999999884 | -0.224 | -0.159 | -0.026 |
| 2.514999999999884 | -0.224 | -0.159 | -0.026 |
| 2.519999999999884 | -0.223 | -0.158 | -0.026 |
| 2.524999999999884 | -0.223 | -0.157 | -0.026 |
| 2.529999999999884 | -0.223 | -0.156 | -0.025 |
| 2.534999999999884 | -0.223 | -0.156 | -0.025 |
| 2.539999999999884 | -0.222 | -0.155 | -0.025 |
| 2.544999999999884 | -0.222 | -0.154 | -0.025 |
| 2.549999999999883 | -0.222 | -0.153 | -0.024 |
| 2.554999999999883 | -0.221 | -0.153 | -0.024 |
| 2.559999999999883 | -0.221 | -0.152 | -0.024 |
| 2.564999999999883 | -0.221 | -0.151 | -0.024 |
| 2.569999999999883 | -0.22 | -0.15 | -0.023 |
| 2.574999999999883 | -0.22 | -0.15 | -0.023 |
| 2.579999999999883 | -0.22 | -0.149 | -0.023 |
| 2.584999999999883 | -0.22 | -0.148 | -0.023 |
| 2.589999999999883 | -0.219 | -0.148 | -0.023 |
| 2.594999999999882 | -0.219 | -0.147 | -0.022 |
| 2.599999999999882 | -0.219 | -0.146 | -0.022 |
| 2.604999999999882 | -0.218 | -0.145 | -0.022 |
| 2.609999999999882 | -0.218 | -0.145 | -0.022 |
| 2.614999999999882 | -0.218 | -0.144 | -0.021 |
| 2.619999999999882 | -0.217 | -0.143 | -0.021 |
| 2.624999999999882 | -0.217 | -0.143 | -0.021 |
| 2.629999999999882 | -0.217 | -0.142 | -0.021 |
| 2.634999999999882 | -0.216 | -0.141 | -0.021 |
| 2.639999999999881 | -0.216 | -0.141 | -0.02 |
| 2.644999999999881 | -0.216 | -0.14 | -0.02 |
| 2.649999999999881 | -0.215 | -0.139 | -0.02 |
| 2.654999999999881 | -0.215 | -0.139 | -0.02 |
| 2.659999999999881 | -0.215 | -0.138 | -0.02 |
| 2.664999999999881 | -0.215 | -0.137 | -0.019 |
| 2.669999999999881 | -0.214 | -0.137 | -0.019 |
| 2.674999999999881 | -0.214 | -0.136 | -0.019 |
| 2.679999999999881 | -0.214 | -0.135 | -0.019 |
| 2.68499999999988 | -0.213 | -0.135 | -0.019 |
| 2.68999999999988 | -0.213 | -0.134 | -0.018 |
| 2.69499999999988 | -0.213 | -0.133 | -0.018 |
| 2.69999999999988 | -0.212 | -0.133 | -0.018 |
| 2.70499999999988 | -0.212 | -0.132 | -0.018 |
| 2.70999999999988 | -0.212 | -0.131 | -0.018 |
| 2.71499999999988 | -0.211 | -0.131 | -0.018 |
| 2.71999999999988 | -0.211 | -0.13 | -0.017 |
| 2.72499999999988 | -0.211 | -0.129 | -0.017 |
| 2.72999999999988 | -0.21 | -0.129 | -0.017 |
| 2.734999999999879 | -0.21 | -0.128 | -0.017 |
| 2.739999999999879 | -0.21 | -0.128 | -0.017 |
| 2.744999999999879 | -0.209 | -0.127 | -0.017 |
| 2.749999999999879 | -0.209 | -0.126 | -0.016 |
| 2.754999999999879 | -0.209 | -0.126 | -0.016 |
| 2.759999999999879 | -0.208 | -0.125 | -0.016 |
| 2.764999999999879 | -0.208 | -0.124 | -0.016 |
| 2.769999999999879 | -0.208 | -0.124 | -0.016 |
| 2.774999999999879 | -0.207 | -0.123 | -0.016 |
| 2.779999999999878 | -0.207 | -0.123 | -0.015 |
| 2.784999999999878 | -0.207 | -0.122 | -0.015 |
| 2.789999999999878 | -0.206 | -0.121 | -0.015 |
| 2.794999999999878 | -0.206 | -0.121 | -0.015 |
| 2.799999999999878 | -0.206 | -0.12 | -0.015 |
| 2.804999999999878 | -0.205 | -0.12 | -0.015 |
| 2.809999999999878 | -0.205 | -0.119 | -0.014 |
| 2.814999999999878 | -0.205 | -0.119 | -0.014 |
| 2.819999999999878 | -0.204 | -0.118 | -0.014 |
| 2.824999999999878 | -0.204 | -0.117 | -0.014 |
| 2.829999999999877 | -0.204 | -0.117 | -0.014 |
| 2.834999999999877 | -0.203 | -0.116 | -0.014 |
| 2.839999999999877 | -0.203 | -0.116 | -0.014 |
| 2.844999999999877 | -0.203 | -0.115 | -0.014 |
| 2.849999999999877 | -0.202 | -0.115 | -0.013 |
| 2.854999999999877 | -0.202 | -0.114 | -0.013 |
| 2.859999999999877 | -0.202 | -0.113 | -0.013 |
| 2.864999999999877 | -0.201 | -0.113 | -0.013 |
| 2.869999999999877 | -0.201 | -0.112 | -0.013 |
| 2.874999999999876 | -0.201 | -0.112 | -0.013 |
| 2.879999999999876 | -0.2 | -0.111 | -0.013 |
| 2.884999999999876 | -0.2 | -0.111 | -0.012 |
| 2.889999999999876 | -0.2 | -0.11 | -0.012 |
| 2.894999999999876 | -0.199 | -0.11 | -0.012 |
| 2.899999999999876 | -0.199 | -0.109 | -0.012 |
| 2.904999999999876 | -0.199 | -0.109 | -0.012 |
| 2.909999999999876 | -0.198 | -0.108 | -0.012 |
| 2.914999999999876 | -0.198 | -0.107 | -0.012 |
| 2.919999999999876 | -0.198 | -0.107 | -0.012 |
| 2.924999999999875 | -0.197 | -0.106 | -0.012 |
| 2.929999999999875 | -0.197 | -0.106 | -0.011 |
| 2.934999999999875 | -0.197 | -0.105 | -0.011 |
| 2.939999999999875 | -0.196 | -0.105 | -0.011 |
| 2.944999999999875 | -0.196 | -0.104 | -0.011 |
| 2.949999999999875 | -0.196 | -0.104 | -0.011 |
| 2.954999999999875 | -0.195 | -0.103 | -0.011 |
| 2.959999999999875 | -0.195 | -0.103 | -0.011 |
| 2.964999999999875 | -0.195 | -0.102 | -0.011 |
| 2.969999999999874 | -0.194 | -0.102 | -0.011 |
| 2.974999999999874 | -0.194 | -0.101 | -0.01 |
| 2.979999999999874 | -0.194 | -0.101 | -0.01 |
| 2.984999999999874 | -0.193 | -0.1 | -0.01 |
| 2.989999999999874 | -0.193 | -0.1 | -0.01 |
| 2.994999999999874 | -0.193 | -0.099 | -0.01 |
| 2.999999999999874 | -0.192 | -0.099 | -0.01 |
| 3.004999999999874 | -0.192 | -0.098 | -0.01 |
| 3.009999999999874 | -0.192 | -0.098 | -0.01 |
| 3.014999999999874 | -0.191 | -0.097 | -0.01 |
| 3.019999999999873 | -0.191 | -0.097 | -0.01 |
| 3.024999999999873 | -0.191 | -0.096 | -0.009 |
| 3.029999999999873 | -0.19 | -0.096 | -0.009 |
| 3.034999999999873 | -0.19 | -0.095 | -0.009 |
| 3.039999999999873 | -0.19 | -0.095 | -0.009 |
| 3.044999999999873 | -0.189 | -0.095 | -0.009 |
| 3.049999999999873 | -0.189 | -0.094 | -0.009 |
| 3.054999999999873 | -0.189 | -0.094 | -0.009 |
| 3.059999999999873 | -0.188 | -0.093 | -0.009 |
| 3.064999999999872 | -0.188 | -0.093 | -0.009 |
| 3.069999999999872 | -0.188 | -0.092 | -0.009 |
| 3.074999999999872 | -0.187 | -0.092 | -0.009 |
| 3.079999999999872 | -0.187 | -0.091 | -0.008 |
| 3.084999999999872 | -0.187 | -0.091 | -0.008 |
| 3.089999999999872 | -0.186 | -0.09 | -0.008 |
| 3.094999999999872 | -0.186 | -0.09 | -0.008 |
| 3.099999999999872 | -0.186 | -0.09 | -0.008 |
| 3.104999999999872 | -0.185 | -0.089 | -0.008 |
| 3.109999999999872 | -0.185 | -0.089 | -0.008 |
| 3.114999999999871 | -0.185 | -0.088 | -0.008 |
| 3.119999999999871 | -0.184 | -0.088 | -0.008 |
| 3.124999999999871 | -0.184 | -0.087 | -0.008 |
| 3.129999999999871 | -0.184 | -0.087 | -0.008 |
| 3.134999999999871 | -0.183 | -0.087 | -0.008 |
| 3.139999999999871 | -0.183 | -0.086 | -0.007 |
| 3.144999999999871 | -0.183 | -0.086 | -0.007 |
| 3.149999999999871 | -0.182 | -0.085 | -0.007 |
| 3.154999999999871 | -0.182 | -0.085 | -0.007 |
| 3.15999999999987 | -0.182 | -0.084 | -0.007 |
| 3.16499999999987 | -0.181 | -0.084 | -0.007 |
| 3.16999999999987 | -0.181 | -0.084 | -0.007 |
| 3.17499999999987 | -0.18 | -0.083 | -0.007 |
| 3.17999999999987 | -0.18 | -0.083 | -0.007 |
| 3.18499999999987 | -0.18 | -0.082 | -0.007 |
| 3.18999999999987 | -0.179 | -0.082 | -0.007 |
| 3.19499999999987 | -0.179 | -0.082 | -0.007 |
| 3.19999999999987 | -0.179 | -0.081 | -0.007 |
| 3.204999999999869 | -0.178 | -0.081 | -0.007 |
| 3.209999999999869 | -0.178 | -0.08 | -0.007 |
| 3.214999999999869 | -0.178 | -0.08 | -0.006 |
| 3.219999999999869 | -0.177 | -0.08 | -0.006 |
| 3.224999999999869 | -0.177 | -0.079 | -0.006 |
| 3.229999999999869 | -0.177 | -0.079 | -0.006 |
| 3.234999999999869 | -0.176 | -0.078 | -0.006 |
| 3.239999999999869 | -0.176 | -0.078 | -0.006 |
| 3.244999999999869 | -0.176 | -0.078 | -0.006 |
| 3.249999999999869 | -0.175 | -0.077 | -0.006 |
| 3.254999999999868 | -0.175 | -0.077 | -0.006 |
| 3.259999999999868 | -0.175 | -0.076 | -0.006 |
| 3.264999999999868 | -0.174 | -0.076 | -0.006 |
| 3.269999999999868 | -0.174 | -0.076 | -0.006 |
| 3.274999999999868 | -0.174 | -0.075 | -0.006 |
| 3.279999999999868 | -0.173 | -0.075 | -0.006 |
| 3.284999999999868 | -0.173 | -0.075 | -0.006 |
| 3.289999999999868 | -0.173 | -0.074 | -0.006 |
| 3.294999999999868 | -0.172 | -0.074 | -0.005 |
| 3.299999999999867 | -0.172 | -0.073 | -0.005 |
| 3.304999999999867 | -0.172 | -0.073 | -0.005 |
| 3.309999999999867 | -0.171 | -0.073 | -0.005 |
| 3.314999999999867 | -0.171 | -0.072 | -0.005 |
| 3.319999999999867 | -0.171 | -0.072 | -0.005 |
| 3.324999999999867 | -0.17 | -0.072 | -0.005 |
| 3.329999999999867 | -0.17 | -0.071 | -0.005 |
| 3.334999999999867 | -0.17 | -0.071 | -0.005 |
| 3.339999999999867 | -0.169 | -0.071 | -0.005 |
| 3.344999999999866 | -0.169 | -0.07 | -0.005 |
| 3.349999999999866 | -0.169 | -0.07 | -0.005 |
| 3.354999999999866 | -0.168 | -0.07 | -0.005 |
| 3.359999999999866 | -0.168 | -0.069 | -0.005 |
| 3.364999999999866 | -0.168 | -0.069 | -0.005 |
| 3.369999999999866 | -0.167 | -0.069 | -0.005 |
| 3.374999999999866 | -0.167 | -0.068 | -0.005 |
| 3.379999999999866 | -0.167 | -0.068 | -0.005 |
| 3.384999999999866 | -0.166 | -0.068 | -0.005 |
| 3.389999999999866 | -0.166 | -0.067 | -0.005 |
| 3.394999999999865 | -0.166 | -0.067 | -0.004 |
| 3.399999999999865 | -0.165 | -0.067 | -0.004 |
| 3.404999999999865 | -0.165 | -0.066 | -0.004 |
| 3.409999999999865 | -0.165 | -0.066 | -0.004 |
| 3.414999999999865 | -0.164 | -0.066 | -0.004 |
| 3.419999999999865 | -0.164 | -0.065 | -0.004 |
| 3.424999999999865 | -0.164 | -0.065 | -0.004 |
| 3.429999999999865 | -0.163 | -0.065 | -0.004 |
| 3.434999999999865 | -0.163 | -0.064 | -0.004 |
| 3.439999999999864 | -0.163 | -0.064 | -0.004 |
| 3.444999999999864 | -0.162 | -0.064 | -0.004 |
| 3.449999999999864 | -0.162 | -0.063 | -0.004 |
| 3.454999999999864 | -0.162 | -0.063 | -0.004 |
| 3.459999999999864 | -0.161 | -0.063 | -0.004 |
| 3.464999999999864 | -0.161 | -0.062 | -0.004 |
| 3.469999999999864 | -0.161 | -0.062 | -0.004 |
| 3.474999999999864 | -0.16 | -0.062 | -0.004 |
| 3.479999999999864 | -0.16 | -0.061 | -0.004 |
| 3.484999999999864 | -0.16 | -0.061 | -0.004 |
| 3.489999999999863 | -0.159 | -0.061 | -0.004 |
| 3.494999999999863 | -0.159 | -0.061 | -0.004 |
| 3.499999999999863 | -0.159 | -0.06 | -0.004 |
| 3.504999999999863 | -0.158 | -0.06 | -0.004 |
| 3.509999999999863 | -0.158 | -0.06 | -0.004 |
| 3.514999999999863 | -0.158 | -0.059 | -0.004 |
| 3.519999999999863 | -0.157 | -0.059 | -0.004 |
| 3.524999999999863 | -0.157 | -0.059 | -0.003 |
| 3.529999999999863 | -0.157 | -0.058 | -0.003 |
| 3.534999999999862 | -0.157 | -0.058 | -0.003 |
| 3.539999999999862 | -0.156 | -0.058 | -0.003 |
| 3.544999999999862 | -0.156 | -0.058 | -0.003 |
| 3.549999999999862 | -0.156 | -0.057 | -0.003 |
| 3.554999999999862 | -0.155 | -0.057 | -0.003 |
| 3.559999999999862 | -0.155 | -0.057 | -0.003 |
| 3.564999999999862 | -0.155 | -0.056 | -0.003 |
| 3.569999999999862 | -0.154 | -0.056 | -0.003 |
| 3.574999999999862 | -0.154 | -0.056 | -0.003 |
| 3.579999999999862 | -0.154 | -0.056 | -0.003 |
| 3.584999999999861 | -0.153 | -0.055 | -0.003 |
| 3.589999999999861 | -0.153 | -0.055 | -0.003 |
| 3.594999999999861 | -0.153 | -0.055 | -0.003 |
| 3.599999999999861 | -0.152 | -0.055 | -0.003 |
| 3.604999999999861 | -0.152 | -0.054 | -0.003 |
| 3.609999999999861 | -0.152 | -0.054 | -0.003 |
| 3.614999999999861 | -0.151 | -0.054 | -0.003 |
| 3.619999999999861 | -0.151 | -0.053 | -0.003 |
| 3.62499999999986 | -0.151 | -0.053 | -0.003 |
| 3.62999999999986 | -0.15 | -0.053 | -0.003 |
| 3.63499999999986 | -0.15 | -0.053 | -0.003 |
| 3.63999999999986 | -0.15 | -0.052 | -0.003 |
| 3.64499999999986 | -0.149 | -0.052 | -0.003 |
| 3.64999999999986 | -0.149 | -0.052 | -0.003 |
| 3.65499999999986 | -0.149 | -0.052 | -0.003 |
| 3.65999999999986 | -0.149 | -0.051 | -0.003 |
| 3.66499999999986 | -0.148 | -0.051 | -0.003 |
| 3.669999999999859 | -0.148 | -0.051 | -0.003 |
| 3.674999999999859 | -0.148 | -0.051 | -0.003 |
| 3.679999999999859 | -0.147 | -0.05 | -0.003 |
| 3.684999999999859 | -0.147 | -0.05 | -0.003 |
| 3.689999999999859 | -0.147 | -0.05 | -0.002 |
| 3.694999999999859 | -0.146 | -0.05 | -0.002 |
| 3.699999999999859 | -0.146 | -0.049 | -0.002 |
| 3.704999999999859 | -0.146 | -0.049 | -0.002 |
| 3.709999999999859 | -0.145 | -0.049 | -0.002 |
| 3.714999999999859 | -0.145 | -0.049 | -0.002 |
| 3.719999999999858 | -0.145 | -0.048 | -0.002 |
| 3.724999999999858 | -0.144 | -0.048 | -0.002 |
| 3.729999999999858 | -0.144 | -0.048 | -0.002 |
| 3.734999999999858 | -0.144 | -0.048 | -0.002 |
| 3.739999999999858 | -0.144 | -0.047 | -0.002 |
| 3.744999999999858 | -0.143 | -0.047 | -0.002 |
| 3.749999999999858 | -0.143 | -0.047 | -0.002 |
| 3.754999999999858 | -0.143 | -0.047 | -0.002 |
| 3.759999999999858 | -0.142 | -0.046 | -0.002 |
| 3.764999999999857 | -0.142 | -0.046 | -0.002 |
| 3.769999999999857 | -0.142 | -0.046 | -0.002 |
| 3.774999999999857 | -0.141 | -0.046 | -0.002 |
| 3.779999999999857 | -0.141 | -0.046 | -0.002 |
| 3.784999999999857 | -0.141 | -0.045 | -0.002 |
| 3.789999999999857 | -0.141 | -0.045 | -0.002 |
| 3.794999999999857 | -0.14 | -0.045 | -0.002 |
| 3.799999999999857 | -0.14 | -0.045 | -0.002 |
| 3.804999999999857 | -0.14 | -0.044 | -0.002 |
| 3.809999999999857 | -0.139 | -0.044 | -0.002 |
| 3.814999999999856 | -0.139 | -0.044 | -0.002 |
| 3.819999999999856 | -0.139 | -0.044 | -0.002 |
| 3.824999999999856 | -0.138 | -0.044 | -0.002 |
| 3.829999999999856 | -0.138 | -0.043 | -0.002 |
| 3.834999999999856 | -0.138 | -0.043 | -0.002 |
| 3.839999999999856 | -0.137 | -0.043 | -0.002 |
| 3.844999999999856 | -0.137 | -0.043 | -0.002 |
| 3.849999999999856 | -0.137 | -0.043 | -0.002 |
| 3.854999999999856 | -0.137 | -0.042 | -0.002 |
| 3.859999999999855 | -0.136 | -0.042 | -0.002 |
| 3.864999999999855 | -0.136 | -0.042 | -0.002 |
| 3.869999999999855 | -0.136 | -0.042 | -0.002 |
| 3.874999999999855 | -0.135 | -0.041 | -0.002 |
| 3.879999999999855 | -0.135 | -0.041 | -0.002 |
| 3.884999999999855 | -0.135 | -0.041 | -0.002 |
| 3.889999999999855 | -0.135 | -0.041 | -0.002 |
| 3.894999999999855 | -0.134 | -0.041 | -0.002 |
| 3.899999999999855 | -0.134 | -0.04 | -0.002 |
| 3.904999999999855 | -0.134 | -0.04 | -0.002 |
| 3.909999999999854 | -0.133 | -0.04 | -0.002 |
| 3.914999999999854 | -0.133 | -0.04 | -0.002 |
| 3.919999999999854 | -0.133 | -0.04 | -0.002 |
| 3.924999999999854 | -0.132 | -0.039 | -0.002 |
| 3.929999999999854 | -0.132 | -0.039 | -0.002 |
| 3.934999999999854 | -0.132 | -0.039 | -0.002 |
| 3.939999999999854 | -0.132 | -0.039 | -0.002 |
| 3.944999999999854 | -0.131 | -0.039 | -0.001 |
| 3.949999999999854 | -0.131 | -0.038 | -0.001 |
| 3.954999999999853 | -0.131 | -0.038 | -0.001 |
| 3.959999999999853 | -0.13 | -0.038 | -0.001 |
| 3.964999999999853 | -0.13 | -0.038 | -0.001 |
| 3.969999999999853 | -0.13 | -0.038 | -0.001 |
| 3.974999999999853 | -0.13 | -0.038 | -0.001 |
| 3.979999999999853 | -0.129 | -0.037 | -0.001 |
| 3.984999999999853 | -0.129 | -0.037 | -0.001 |
| 3.989999999999853 | -0.129 | -0.037 | -0.001 |
| 3.994999999999853 | -0.128 | -0.037 | -0.001 |
| 3.999999999999853 | -0.128 | -0.037 | -0.001 |
| 4.004999999999852 | -0.128 | -0.036 | -0.001 |
| 4.009999999999852 | -0.128 | -0.036 | -0.001 |
| 4.014999999999852 | -0.127 | -0.036 | -0.001 |
| 4.019999999999852 | -0.127 | -0.036 | -0.001 |
| 4.024999999999852 | -0.127 | -0.036 | -0.001 |
| 4.029999999999852 | -0.126 | -0.036 | -0.001 |
| 4.034999999999852 | -0.126 | -0.035 | -0.001 |
| 4.039999999999851 | -0.126 | -0.035 | -0.001 |
| 4.044999999999852 | -0.126 | -0.035 | -0.001 |
| 4.049999999999851 | -0.125 | -0.035 | -0.001 |
| 4.054999999999851 | -0.125 | -0.035 | -0.001 |
| 4.059999999999851 | -0.125 | -0.034 | -0.001 |
| 4.064999999999851 | -0.124 | -0.034 | -0.001 |
| 4.069999999999851 | -0.124 | -0.034 | -0.001 |
| 4.074999999999851 | -0.124 | -0.034 | -0.001 |
| 4.07999999999985 | -0.124 | -0.034 | -0.001 |
| 4.084999999999851 | -0.123 | -0.034 | -0.001 |
| 4.08999999999985 | -0.123 | -0.033 | -0.001 |
| 4.094999999999851 | -0.123 | -0.033 | -0.001 |
| 4.09999999999985 | -0.123 | -0.033 | -0.001 |
| 4.10499999999985 | -0.122 | -0.033 | -0.001 |
| 4.10999999999985 | -0.122 | -0.033 | -0.001 |
| 4.11499999999985 | -0.122 | -0.033 | -0.001 |
| 4.11999999999985 | -0.121 | -0.032 | -0.001 |
| 4.12499999999985 | -0.121 | -0.032 | -0.001 |
| 4.12999999999985 | -0.121 | -0.032 | -0.001 |
| 4.13499999999985 | -0.121 | -0.032 | -0.001 |
| 4.13999999999985 | -0.12 | -0.032 | -0.001 |
| 4.144999999999849 | -0.12 | -0.032 | -0.001 |
| 4.14999999999985 | -0.12 | -0.032 | -0.001 |
| 4.154999999999849 | -0.12 | -0.031 | -0.001 |
| 4.15999999999985 | -0.119 | -0.031 | -0.001 |
| 4.164999999999849 | -0.119 | -0.031 | -0.001 |
| 4.169999999999849 | -0.119 | -0.031 | -0.001 |
| 4.174999999999849 | -0.118 | -0.031 | -0.001 |
| 4.179999999999848 | -0.118 | -0.031 | -0.001 |
| 4.184999999999849 | -0.118 | -0.03 | -0.001 |
| 4.189999999999848 | -0.118 | -0.03 | -0.001 |
| 4.194999999999848 | -0.117 | -0.03 | -0.001 |
| 4.199999999999848 | -0.117 | -0.03 | -0.001 |
| 4.204999999999848 | -0.117 | -0.03 | -0.001 |
| 4.209999999999848 | -0.117 | -0.03 | -0.001 |
| 4.214999999999848 | -0.116 | -0.03 | -0.001 |
| 4.219999999999847 | -0.116 | -0.029 | -0.001 |
| 4.224999999999848 | -0.116 | -0.029 | -0.001 |
| 4.229999999999847 | -0.115 | -0.029 | -0.001 |
| 4.234999999999847 | -0.115 | -0.029 | -0.001 |
| 4.239999999999847 | -0.115 | -0.029 | -0.001 |
| 4.244999999999847 | -0.115 | -0.029 | -0.001 |
| 4.249999999999847 | -0.114 | -0.029 | -0.001 |
| 4.254999999999847 | -0.114 | -0.028 | -0.001 |
| 4.259999999999846 | -0.114 | -0.028 | -0.001 |
| 4.264999999999847 | -0.114 | -0.028 | -0.001 |
| 4.269999999999846 | -0.113 | -0.028 | -0.001 |
| 4.274999999999846 | -0.113 | -0.028 | -0.001 |
| 4.279999999999846 | -0.113 | -0.028 | -0.001 |
| 4.284999999999846 | -0.113 | -0.028 | -0.001 |
| 4.289999999999846 | -0.112 | -0.027 | -0.001 |
| 4.294999999999846 | -0.112 | -0.027 | -0.001 |
| 4.299999999999846 | -0.112 | -0.027 | -0.001 |
| 4.304999999999846 | -0.112 | -0.027 | -0.001 |
| 4.309999999999845 | -0.111 | -0.027 | -0.001 |
| 4.314999999999846 | -0.111 | -0.027 | -0.001 |
| 4.319999999999845 | -0.111 | -0.027 | -0.001 |
| 4.324999999999846 | -0.111 | -0.026 | -0.001 |
| 4.329999999999845 | -0.11 | -0.026 | -0.001 |
| 4.334999999999845 | -0.11 | -0.026 | -0.001 |
| 4.339999999999845 | -0.11 | -0.026 | -0.001 |
| 4.344999999999845 | -0.11 | -0.026 | -0.001 |
| 4.349999999999845 | -0.109 | -0.026 | -0.001 |
| 4.354999999999845 | -0.109 | -0.026 | -0.001 |
| 4.359999999999844 | -0.109 | -0.026 | -0.001 |
| 4.364999999999845 | -0.109 | -0.025 | -0.001 |
| 4.369999999999844 | -0.108 | -0.025 | -0.001 |
| 4.374999999999844 | -0.108 | -0.025 | -0.001 |
| 4.379999999999844 | -0.108 | -0.025 | -0.001 |
| 4.384999999999844 | -0.108 | -0.025 | -0.001 |
| 4.389999999999844 | -0.107 | -0.025 | -0.001 |
| 4.394999999999844 | -0.107 | -0.025 | -0.001 |
| 4.399999999999844 | -0.107 | -0.025 | -0.001 |
| 4.404999999999844 | -0.107 | -0.024 | -0.001 |
| 4.409999999999843 | -0.106 | -0.024 | -0.001 |
| 4.414999999999844 | -0.106 | -0.024 | -0.001 |
| 4.419999999999843 | -0.106 | -0.024 | -0.001 |
| 4.424999999999843 | -0.106 | -0.024 | -0.001 |
| 4.429999999999843 | -0.105 | -0.024 | -0.001 |
| 4.434999999999843 | -0.105 | -0.024 | -0.001 |
| 4.439999999999843 | -0.105 | -0.024 | -0.001 |
| 4.444999999999843 | -0.105 | -0.023 | -0.001 |
| 4.449999999999842 | -0.104 | -0.023 | -0.001 |
| 4.454999999999843 | -0.104 | -0.023 | -0.001 |
| 4.459999999999842 | -0.104 | -0.023 | -0.001 |
| 4.464999999999843 | -0.104 | -0.023 | -0.001 |
| 4.469999999999842 | -0.103 | -0.023 | -0.001 |
| 4.474999999999842 | -0.103 | -0.023 | -0.001 |
| 4.479999999999842 | -0.103 | -0.023 | -0.001 |
| 4.484999999999842 | -0.103 | -0.023 | -0.001 |
| 4.489999999999842 | -0.102 | -0.022 | -0.001 |
| 4.494999999999842 | -0.102 | -0.022 | 0 |
| 4.499999999999841 | -0.102 | -0.022 | 0 |
| 4.504999999999842 | -0.102 | -0.022 | 0 |
| 4.509999999999841 | -0.101 | -0.022 | 0 |
| 4.514999999999842 | -0.101 | -0.022 | 0 |
| 4.519999999999841 | -0.101 | -0.022 | 0 |
| 4.524999999999841 | -0.101 | -0.022 | 0 |
| 4.529999999999841 | -0.101 | -0.022 | 0 |
| 4.534999999999841 | -0.1 | -0.021 | 0 |
| 4.53999999999984 | -0.1 | -0.021 | 0 |
| 4.544999999999841 | -0.1 | -0.021 | 0 |
| 4.54999999999984 | -0.1 | -0.021 | 0 |
| 4.554999999999841 | -0.099 | -0.021 | 0 |
| 4.55999999999984 | -0.099 | -0.021 | 0 |
| 4.564999999999841 | -0.099 | -0.021 | 0 |
| 4.56999999999984 | -0.099 | -0.021 | 0 |
| 4.57499999999984 | -0.098 | -0.021 | 0 |
| 4.57999999999984 | -0.098 | -0.021 | 0 |
| 4.58499999999984 | -0.098 | -0.02 | 0 |
| 4.58999999999984 | -0.098 | -0.02 | 0 |
| 4.59499999999984 | -0.098 | -0.02 | 0 |
| 4.59999999999984 | -0.097 | -0.02 | 0 |
| 4.60499999999984 | -0.097 | -0.02 | 0 |
| 4.60999999999984 | -0.097 | -0.02 | 0 |
| 4.614999999999839 | -0.097 | -0.02 | 0 |
| 4.61999999999984 | -0.096 | -0.02 | 0 |
| 4.624999999999839 | -0.096 | -0.02 | 0 |
| 4.62999999999984 | -0.096 | -0.02 | 0 |
| 4.634999999999839 | -0.096 | -0.019 | 0 |
| 4.639999999999838 | -0.095 | -0.019 | 0 |
| 4.644999999999839 | -0.095 | -0.019 | 0 |
| 4.649999999999838 | -0.095 | -0.019 | 0 |
| 4.654999999999839 | -0.095 | -0.019 | 0 |
| 4.659999999999838 | -0.095 | -0.019 | 0 |
| 4.664999999999838 | -0.094 | -0.019 | 0 |
| 4.669999999999838 | -0.094 | -0.019 | 0 |
| 4.674999999999838 | -0.094 | -0.019 | 0 |
| 4.679999999999837 | -0.094 | -0.019 | 0 |
| 4.684999999999838 | -0.093 | -0.018 | 0 |
| 4.689999999999837 | -0.093 | -0.018 | 0 |
| 4.694999999999838 | -0.093 | -0.018 | 0 |
| 4.699999999999837 | -0.093 | -0.018 | 0 |
| 4.704999999999837 | -0.093 | -0.018 | 0 |
| 4.709999999999837 | -0.092 | -0.018 | 0 |
| 4.714999999999837 | -0.092 | -0.018 | 0 |
| 4.719999999999837 | -0.092 | -0.018 | 0 |
| 4.724999999999837 | -0.092 | -0.018 | 0 |
| 4.729999999999836 | -0.091 | -0.018 | 0 |
| 4.734999999999836 | -0.091 | -0.018 | 0 |
| 4.739999999999836 | -0.091 | -0.017 | 0 |
| 4.744999999999836 | -0.091 | -0.017 | 0 |
| 4.749999999999836 | -0.091 | -0.017 | 0 |
| 4.754999999999836 | -0.09 | -0.017 | 0 |
| 4.759999999999836 | -0.09 | -0.017 | 0 |
| 4.764999999999836 | -0.09 | -0.017 | 0 |
| 4.769999999999836 | -0.09 | -0.017 | 0 |
| 4.774999999999835 | -0.09 | -0.017 | 0 |
| 4.779999999999835 | -0.089 | -0.017 | 0 |
| 4.784999999999835 | -0.089 | -0.017 | 0 |
| 4.789999999999835 | -0.089 | -0.017 | 0 |
| 4.794999999999835 | -0.089 | -0.017 | 0 |
| 4.799999999999835 | -0.089 | -0.016 | 0 |
| 4.804999999999835 | -0.088 | -0.016 | 0 |
| 4.809999999999835 | -0.088 | -0.016 | 0 |
| 4.814999999999835 | -0.088 | -0.016 | 0 |
| 4.819999999999835 | -0.088 | -0.016 | 0 |
| 4.824999999999835 | -0.087 | -0.016 | 0 |
| 4.829999999999834 | -0.087 | -0.016 | 0 |
| 4.834999999999834 | -0.087 | -0.016 | 0 |
| 4.839999999999834 | -0.087 | -0.016 | 0 |
| 4.844999999999834 | -0.087 | -0.016 | 0 |
| 4.849999999999834 | -0.086 | -0.016 | 0 |
| 4.854999999999834 | -0.086 | -0.016 | 0 |
| 4.859999999999834 | -0.086 | -0.015 | 0 |
| 4.864999999999834 | -0.086 | -0.015 | 0 |
| 4.869999999999834 | -0.086 | -0.015 | 0 |
| 4.874999999999834 | -0.085 | -0.015 | 0 |
| 4.879999999999833 | -0.085 | -0.015 | 0 |
| 4.884999999999834 | -0.085 | -0.015 | 0 |
| 4.889999999999833 | -0.085 | -0.015 | 0 |
| 4.894999999999833 | -0.085 | -0.015 | 0 |
| 4.899999999999833 | -0.084 | -0.015 | 0 |
| 4.904999999999833 | -0.084 | -0.015 | 0 |
| 4.909999999999833 | -0.084 | -0.015 | 0 |
| 4.914999999999833 | -0.084 | -0.015 | 0 |
| 4.919999999999832 | -0.084 | -0.015 | 0 |
| 4.924999999999833 | -0.083 | -0.015 | 0 |
| 4.929999999999832 | -0.083 | -0.014 | 0 |
| 4.934999999999832 | -0.083 | -0.014 | 0 |
| 4.939999999999832 | -0.083 | -0.014 | 0 |
| 4.944999999999832 | -0.083 | -0.014 | 0 |
| 4.949999999999832 | -0.082 | -0.014 | 0 |
| 4.954999999999832 | -0.082 | -0.014 | 0 |
| 4.959999999999832 | -0.082 | -0.014 | 0 |
| 4.964999999999832 | -0.082 | -0.014 | 0 |
| 4.969999999999831 | -0.082 | -0.014 | 0 |
| 4.974999999999831 | -0.081 | -0.014 | 0 |
| 4.97999999999983 | -0.081 | -0.014 | 0 |
| 4.984999999999831 | -0.081 | -0.014 | 0 |
| 4.98999999999983 | -0.081 | -0.014 | 0 |
| 4.994999999999831 | -0.081 | -0.014 | 0 |
| 4.99999999999983 | -0.08 | -0.013 | 0 |